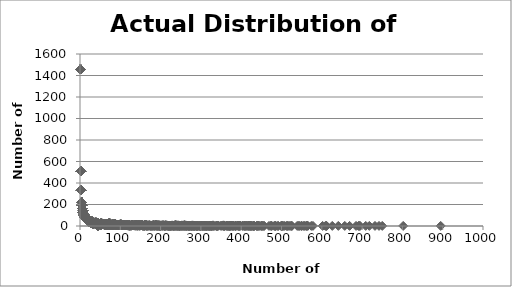
| Category | Actual Number of Athletes |
|---|---|
| 895.0 | 1 |
| 802.0 | 1 |
| 750.0 | 1 |
| 742.0 | 1 |
| 732.0 | 1 |
| 718.0 | 1 |
| 709.0 | 1 |
| 695.0 | 1 |
| 693.0 | 1 |
| 691.0 | 1 |
| 685.0 | 1 |
| 669.0 | 1 |
| 657.0 | 1 |
| 641.0 | 1 |
| 626.0 | 1 |
| 612.0 | 1 |
| 611.0 | 1 |
| 609.0 | 1 |
| 602.0 | 1 |
| 578.0 | 1 |
| 574.0 | 1 |
| 565.0 | 2 |
| 565.0 | 2 |
| 562.0 | 1 |
| 561.0 | 1 |
| 557.0 | 1 |
| 550.0 | 1 |
| 549.0 | 1 |
| 545.0 | 1 |
| 542.0 | 1 |
| 539.0 | 1 |
| 554.0 | 1 |
| 526.0 | 1 |
| 525.0 | 1 |
| 523.0 | 1 |
| 519.0 | 1 |
| 516.0 | 1 |
| 514.0 | 1 |
| 513.0 | 1 |
| 508.0 | 1 |
| 504.0 | 1 |
| 503.0 | 1 |
| 501.0 | 1 |
| 500.0 | 1 |
| 499.0 | 1 |
| 492.0 | 1 |
| 491.0 | 1 |
| 486.0 | 1 |
| 485.0 | 1 |
| 484.0 | 1 |
| 482.0 | 1 |
| 476.0 | 1 |
| 474.0 | 2 |
| 474.0 | 2 |
| 469.0 | 1 |
| 457.0 | 1 |
| 456.0 | 1 |
| 453.0 | 1 |
| 451.0 | 2 |
| 451.0 | 2 |
| 449.0 | 1 |
| 445.0 | 1 |
| 442.0 | 2 |
| 442.0 | 2 |
| 441.0 | 1 |
| 439.0 | 1 |
| 438.0 | 1 |
| 433.0 | 1 |
| 432.0 | 1 |
| 431.0 | 1 |
| 430.0 | 1 |
| 429.0 | 1 |
| 426.0 | 1 |
| 425.0 | 1 |
| 423.0 | 1 |
| 422.0 | 3 |
| 422.0 | 3 |
| 422.0 | 3 |
| 421.0 | 1 |
| 418.0 | 2 |
| 418.0 | 2 |
| 417.0 | 1 |
| 414.0 | 2 |
| 414.0 | 2 |
| 411.0 | 1 |
| 409.0 | 2 |
| 409.0 | 2 |
| 407.0 | 2 |
| 407.0 | 2 |
| 403.0 | 2 |
| 403.0 | 2 |
| 397.0 | 3 |
| 397.0 | 3 |
| 397.0 | 3 |
| 396.0 | 3 |
| 396.0 | 3 |
| 396.0 | 3 |
| 395.0 | 1 |
| 394.0 | 2 |
| 394.0 | 2 |
| 392.0 | 3 |
| 392.0 | 3 |
| 392.0 | 3 |
| 387.0 | 2 |
| 387.0 | 2 |
| 386.0 | 1 |
| 385.0 | 1 |
| 382.0 | 1 |
| 380.0 | 2 |
| 380.0 | 2 |
| 378.0 | 1 |
| 376.0 | 3 |
| 376.0 | 3 |
| 376.0 | 3 |
| 373.0 | 2 |
| 373.0 | 2 |
| 372.0 | 1 |
| 371.0 | 1 |
| 370.0 | 1 |
| 368.0 | 1 |
| 367.0 | 1 |
| 365.0 | 1 |
| 364.0 | 3 |
| 364.0 | 3 |
| 364.0 | 3 |
| 342.0 | 2 |
| 359.0 | 2 |
| 359.0 | 2 |
| 358.0 | 3 |
| 358.0 | 3 |
| 358.0 | 3 |
| 357.0 | 3 |
| 357.0 | 3 |
| 357.0 | 3 |
| 356.0 | 5 |
| 356.0 | 5 |
| 356.0 | 5 |
| 356.0 | 5 |
| 356.0 | 5 |
| 355.0 | 1 |
| 350.0 | 2 |
| 350.0 | 2 |
| 343.0 | 4 |
| 343.0 | 4 |
| 343.0 | 4 |
| 343.0 | 4 |
| 342.0 | 2 |
| 341.0 | 2 |
| 341.0 | 2 |
| 339.0 | 2 |
| 339.0 | 2 |
| 338.0 | 2 |
| 338.0 | 2 |
| 333.0 | 1 |
| 331.0 | 1 |
| 330.0 | 5 |
| 330.0 | 5 |
| 330.0 | 5 |
| 330.0 | 5 |
| 330.0 | 5 |
| 329.0 | 1 |
| 327.0 | 1 |
| 326.0 | 2 |
| 326.0 | 2 |
| 325.0 | 3 |
| 325.0 | 3 |
| 325.0 | 3 |
| 324.0 | 3 |
| 324.0 | 3 |
| 324.0 | 3 |
| 322.0 | 1 |
| 321.0 | 2 |
| 321.0 | 2 |
| 320.0 | 1 |
| 319.0 | 1 |
| 317.0 | 1 |
| 315.0 | 2 |
| 315.0 | 2 |
| 314.0 | 2 |
| 314.0 | 2 |
| 313.0 | 1 |
| 311.0 | 2 |
| 311.0 | 2 |
| 310.0 | 2 |
| 310.0 | 2 |
| 308.0 | 3 |
| 308.0 | 3 |
| 308.0 | 3 |
| 307.0 | 1 |
| 305.0 | 1 |
| 304.0 | 2 |
| 304.0 | 2 |
| 302.0 | 3 |
| 302.0 | 3 |
| 302.0 | 3 |
| 300.0 | 1 |
| 299.0 | 1 |
| 298.0 | 1 |
| 297.0 | 1 |
| 296.0 | 1 |
| 293.0 | 2 |
| 293.0 | 2 |
| 292.0 | 1 |
| 291.0 | 1 |
| 290.0 | 1 |
| 289.0 | 1 |
| 288.0 | 2 |
| 288.0 | 2 |
| 285.0 | 2 |
| 285.0 | 2 |
| 284.0 | 3 |
| 284.0 | 3 |
| 284.0 | 3 |
| 283.0 | 1 |
| 282.0 | 2 |
| 282.0 | 2 |
| 280.0 | 1 |
| 279.0 | 5 |
| 279.0 | 5 |
| 279.0 | 5 |
| 279.0 | 5 |
| 279.0 | 5 |
| 278.0 | 2 |
| 278.0 | 2 |
| 277.0 | 1 |
| 276.0 | 1 |
| 275.0 | 4 |
| 275.0 | 4 |
| 275.0 | 4 |
| 275.0 | 4 |
| 274.0 | 3 |
| 274.0 | 3 |
| 274.0 | 3 |
| 272.0 | 2 |
| 272.0 | 2 |
| 271.0 | 3 |
| 271.0 | 3 |
| 271.0 | 3 |
| 270.0 | 2 |
| 270.0 | 2 |
| 269.0 | 1 |
| 267.0 | 4 |
| 267.0 | 4 |
| 267.0 | 4 |
| 267.0 | 4 |
| 266.0 | 3 |
| 266.0 | 3 |
| 266.0 | 3 |
| 265.0 | 4 |
| 265.0 | 4 |
| 265.0 | 4 |
| 265.0 | 4 |
| 264.0 | 1 |
| 263.0 | 1 |
| 262.0 | 5 |
| 262.0 | 5 |
| 262.0 | 5 |
| 262.0 | 5 |
| 262.0 | 5 |
| 261.0 | 3 |
| 261.0 | 3 |
| 261.0 | 3 |
| 260.0 | 2 |
| 260.0 | 2 |
| 259.0 | 6 |
| 259.0 | 6 |
| 259.0 | 6 |
| 259.0 | 6 |
| 259.0 | 6 |
| 259.0 | 6 |
| 257.0 | 4 |
| 257.0 | 4 |
| 257.0 | 4 |
| 257.0 | 4 |
| 256.0 | 3 |
| 256.0 | 3 |
| 256.0 | 3 |
| 255.0 | 1 |
| 253.0 | 5 |
| 253.0 | 5 |
| 253.0 | 5 |
| 253.0 | 5 |
| 253.0 | 5 |
| 252.0 | 3 |
| 252.0 | 3 |
| 252.0 | 3 |
| 251.0 | 1 |
| 250.0 | 4 |
| 250.0 | 4 |
| 250.0 | 4 |
| 250.0 | 4 |
| 249.0 | 4 |
| 249.0 | 4 |
| 249.0 | 4 |
| 249.0 | 4 |
| 248.0 | 3 |
| 248.0 | 3 |
| 248.0 | 3 |
| 247.0 | 1 |
| 246.0 | 2 |
| 246.0 | 2 |
| 245.0 | 1 |
| 244.0 | 5 |
| 244.0 | 5 |
| 244.0 | 5 |
| 244.0 | 5 |
| 244.0 | 5 |
| 243.0 | 2 |
| 243.0 | 2 |
| 242.0 | 5 |
| 242.0 | 5 |
| 242.0 | 5 |
| 242.0 | 5 |
| 242.0 | 5 |
| 241.0 | 3 |
| 241.0 | 3 |
| 241.0 | 3 |
| 240.0 | 3 |
| 240.0 | 3 |
| 240.0 | 3 |
| 239.0 | 4 |
| 239.0 | 4 |
| 239.0 | 4 |
| 239.0 | 4 |
| 238.0 | 6 |
| 238.0 | 6 |
| 238.0 | 6 |
| 238.0 | 6 |
| 238.0 | 6 |
| 238.0 | 6 |
| 237.0 | 2 |
| 237.0 | 2 |
| 236.0 | 6 |
| 236.0 | 6 |
| 236.0 | 6 |
| 236.0 | 6 |
| 236.0 | 6 |
| 236.0 | 6 |
| 234.0 | 2 |
| 234.0 | 2 |
| 233.0 | 1 |
| 232.0 | 3 |
| 232.0 | 3 |
| 232.0 | 3 |
| 231.0 | 2 |
| 231.0 | 2 |
| 230.0 | 4 |
| 230.0 | 4 |
| 230.0 | 4 |
| 230.0 | 4 |
| 229.0 | 5 |
| 229.0 | 5 |
| 229.0 | 5 |
| 229.0 | 5 |
| 229.0 | 5 |
| 228.0 | 4 |
| 228.0 | 4 |
| 228.0 | 4 |
| 228.0 | 4 |
| 227.0 | 4 |
| 227.0 | 4 |
| 227.0 | 4 |
| 227.0 | 4 |
| 226.0 | 2 |
| 226.0 | 2 |
| 225.0 | 1 |
| 224.0 | 3 |
| 224.0 | 3 |
| 224.0 | 3 |
| 223.0 | 4 |
| 223.0 | 4 |
| 223.0 | 4 |
| 223.0 | 4 |
| 222.0 | 2 |
| 222.0 | 2 |
| 221.0 | 2 |
| 221.0 | 2 |
| 220.0 | 4 |
| 220.0 | 4 |
| 220.0 | 4 |
| 220.0 | 4 |
| 219.0 | 2 |
| 219.0 | 2 |
| 217.0 | 3 |
| 217.0 | 3 |
| 217.0 | 3 |
| 216.0 | 4 |
| 216.0 | 4 |
| 216.0 | 4 |
| 216.0 | 4 |
| 215.0 | 5 |
| 215.0 | 5 |
| 215.0 | 5 |
| 215.0 | 5 |
| 215.0 | 5 |
| 214.0 | 5 |
| 214.0 | 5 |
| 214.0 | 5 |
| 214.0 | 5 |
| 214.0 | 5 |
| 213.0 | 2 |
| 213.0 | 2 |
| 212.0 | 6 |
| 212.0 | 6 |
| 212.0 | 6 |
| 212.0 | 6 |
| 212.0 | 6 |
| 212.0 | 6 |
| 211.0 | 3 |
| 211.0 | 3 |
| 211.0 | 3 |
| 210.0 | 2 |
| 210.0 | 2 |
| 209.0 | 3 |
| 209.0 | 3 |
| 209.0 | 3 |
| 208.0 | 4 |
| 208.0 | 4 |
| 208.0 | 4 |
| 208.0 | 4 |
| 207.0 | 5 |
| 207.0 | 5 |
| 207.0 | 5 |
| 207.0 | 5 |
| 207.0 | 5 |
| 206.0 | 6 |
| 206.0 | 6 |
| 206.0 | 6 |
| 206.0 | 6 |
| 206.0 | 6 |
| 206.0 | 6 |
| 205.0 | 4 |
| 205.0 | 4 |
| 205.0 | 4 |
| 205.0 | 4 |
| 204.0 | 3 |
| 204.0 | 3 |
| 204.0 | 3 |
| 203.0 | 4 |
| 203.0 | 4 |
| 203.0 | 4 |
| 203.0 | 4 |
| 202.0 | 5 |
| 202.0 | 5 |
| 202.0 | 5 |
| 202.0 | 5 |
| 202.0 | 5 |
| 201.0 | 5 |
| 201.0 | 5 |
| 201.0 | 5 |
| 201.0 | 5 |
| 201.0 | 5 |
| 200.0 | 3 |
| 200.0 | 3 |
| 200.0 | 3 |
| 199.0 | 1 |
| 198.0 | 2 |
| 198.0 | 2 |
| 197.0 | 3 |
| 197.0 | 3 |
| 197.0 | 3 |
| 196.0 | 6 |
| 196.0 | 6 |
| 196.0 | 6 |
| 196.0 | 6 |
| 196.0 | 6 |
| 196.0 | 6 |
| 195.0 | 3 |
| 195.0 | 3 |
| 195.0 | 3 |
| 194.0 | 4 |
| 20.0 | 63 |
| 194.0 | 4 |
| 194.0 | 4 |
| 194.0 | 4 |
| 193.0 | 6 |
| 193.0 | 6 |
| 193.0 | 6 |
| 193.0 | 6 |
| 193.0 | 6 |
| 193.0 | 6 |
| 192.0 | 1 |
| 20.0 | 63 |
| 191.0 | 4 |
| 191.0 | 4 |
| 191.0 | 4 |
| 191.0 | 4 |
| 190.0 | 7 |
| 190.0 | 7 |
| 190.0 | 7 |
| 190.0 | 7 |
| 190.0 | 7 |
| 190.0 | 7 |
| 190.0 | 7 |
| 189.0 | 2 |
| 189.0 | 2 |
| 188.0 | 5 |
| 188.0 | 5 |
| 188.0 | 5 |
| 188.0 | 5 |
| 188.0 | 5 |
| 187.0 | 9 |
| 187.0 | 9 |
| 187.0 | 9 |
| 187.0 | 9 |
| 187.0 | 9 |
| 187.0 | 9 |
| 187.0 | 9 |
| 187.0 | 9 |
| 187.0 | 9 |
| 186.0 | 4 |
| 186.0 | 4 |
| 186.0 | 4 |
| 186.0 | 4 |
| 185.0 | 4 |
| 185.0 | 4 |
| 185.0 | 4 |
| 185.0 | 4 |
| 184.0 | 3 |
| 184.0 | 3 |
| 184.0 | 3 |
| 183.0 | 5 |
| 183.0 | 5 |
| 183.0 | 5 |
| 183.0 | 5 |
| 183.0 | 5 |
| 182.0 | 7 |
| 182.0 | 7 |
| 182.0 | 7 |
| 182.0 | 7 |
| 182.0 | 7 |
| 182.0 | 7 |
| 182.0 | 7 |
| 181.0 | 3 |
| 181.0 | 3 |
| 181.0 | 3 |
| 180.0 | 5 |
| 180.0 | 5 |
| 180.0 | 5 |
| 180.0 | 5 |
| 180.0 | 5 |
| 179.0 | 4 |
| 179.0 | 4 |
| 179.0 | 4 |
| 179.0 | 4 |
| 178.0 | 3 |
| 178.0 | 3 |
| 178.0 | 3 |
| 177.0 | 4 |
| 177.0 | 4 |
| 177.0 | 4 |
| 177.0 | 4 |
| 176.0 | 4 |
| 176.0 | 4 |
| 176.0 | 4 |
| 176.0 | 4 |
| 175.0 | 4 |
| 175.0 | 4 |
| 175.0 | 4 |
| 175.0 | 4 |
| 174.0 | 3 |
| 174.0 | 3 |
| 174.0 | 3 |
| 173.0 | 5 |
| 173.0 | 5 |
| 173.0 | 5 |
| 173.0 | 5 |
| 173.0 | 5 |
| 172.0 | 6 |
| 172.0 | 6 |
| 172.0 | 6 |
| 172.0 | 6 |
| 172.0 | 6 |
| 172.0 | 6 |
| 171.0 | 5 |
| 171.0 | 5 |
| 171.0 | 5 |
| 171.0 | 5 |
| 171.0 | 5 |
| 170.0 | 4 |
| 170.0 | 4 |
| 170.0 | 4 |
| 170.0 | 4 |
| 169.0 | 4 |
| 169.0 | 4 |
| 169.0 | 4 |
| 169.0 | 4 |
| 169.0 | 4 |
| 168.0 | 4 |
| 168.0 | 4 |
| 168.0 | 4 |
| 168.0 | 4 |
| 167.0 | 3 |
| 167.0 | 3 |
| 167.0 | 3 |
| 166.0 | 6 |
| 166.0 | 6 |
| 166.0 | 6 |
| 166.0 | 6 |
| 166.0 | 6 |
| 166.0 | 6 |
| 165.0 | 2 |
| 165.0 | 2 |
| 164.0 | 6 |
| 164.0 | 6 |
| 164.0 | 6 |
| 164.0 | 6 |
| 164.0 | 6 |
| 164.0 | 6 |
| 163.0 | 4 |
| 163.0 | 4 |
| 163.0 | 4 |
| 163.0 | 4 |
| 162.0 | 13 |
| 162.0 | 13 |
| 162.0 | 13 |
| 162.0 | 13 |
| 162.0 | 13 |
| 162.0 | 13 |
| 162.0 | 13 |
| 162.0 | 13 |
| 162.0 | 13 |
| 162.0 | 13 |
| 162.0 | 13 |
| 162.0 | 13 |
| 162.0 | 13 |
| 161.0 | 7 |
| 161.0 | 7 |
| 161.0 | 7 |
| 161.0 | 7 |
| 161.0 | 7 |
| 161.0 | 7 |
| 161.0 | 7 |
| 160.0 | 2 |
| 160.0 | 2 |
| 159.0 | 3 |
| 159.0 | 3 |
| 159.0 | 3 |
| 158.0 | 5 |
| 158.0 | 5 |
| 158.0 | 5 |
| 158.0 | 5 |
| 158.0 | 5 |
| 157.0 | 3 |
| 157.0 | 3 |
| 157.0 | 3 |
| 156.0 | 3 |
| 156.0 | 3 |
| 156.0 | 3 |
| 155.0 | 8 |
| 155.0 | 8 |
| 155.0 | 8 |
| 155.0 | 8 |
| 155.0 | 8 |
| 155.0 | 8 |
| 155.0 | 8 |
| 155.0 | 8 |
| 154.0 | 8 |
| 154.0 | 8 |
| 154.0 | 8 |
| 154.0 | 8 |
| 154.0 | 8 |
| 154.0 | 8 |
| 154.0 | 8 |
| 154.0 | 8 |
| 153.0 | 8 |
| 153.0 | 8 |
| 153.0 | 8 |
| 153.0 | 8 |
| 153.0 | 8 |
| 153.0 | 8 |
| 153.0 | 8 |
| 153.0 | 8 |
| 152.0 | 6 |
| 152.0 | 6 |
| 152.0 | 6 |
| 152.0 | 6 |
| 152.0 | 6 |
| 152.0 | 6 |
| 151.0 | 7 |
| 151.0 | 7 |
| 151.0 | 7 |
| 151.0 | 7 |
| 151.0 | 7 |
| 151.0 | 7 |
| 151.0 | 7 |
| 150.0 | 7 |
| 150.0 | 7 |
| 150.0 | 7 |
| 150.0 | 7 |
| 150.0 | 7 |
| 150.0 | 7 |
| 150.0 | 7 |
| 149.0 | 4 |
| 149.0 | 4 |
| 149.0 | 4 |
| 149.0 | 4 |
| 148.0 | 7 |
| 148.0 | 7 |
| 148.0 | 7 |
| 148.0 | 7 |
| 148.0 | 7 |
| 148.0 | 7 |
| 148.0 | 7 |
| 147.0 | 1 |
| 146.0 | 8 |
| 146.0 | 8 |
| 146.0 | 8 |
| 146.0 | 8 |
| 146.0 | 8 |
| 146.0 | 8 |
| 146.0 | 8 |
| 146.0 | 8 |
| 145.0 | 11 |
| 145.0 | 11 |
| 145.0 | 11 |
| 145.0 | 11 |
| 145.0 | 11 |
| 145.0 | 11 |
| 145.0 | 11 |
| 145.0 | 11 |
| 145.0 | 11 |
| 145.0 | 11 |
| 145.0 | 11 |
| 144.0 | 7 |
| 144.0 | 7 |
| 144.0 | 7 |
| 144.0 | 7 |
| 144.0 | 7 |
| 144.0 | 7 |
| 144.0 | 7 |
| 143.0 | 2 |
| 143.0 | 2 |
| 142.0 | 6 |
| 142.0 | 6 |
| 142.0 | 6 |
| 142.0 | 6 |
| 142.0 | 6 |
| 142.0 | 6 |
| 141.0 | 6 |
| 141.0 | 6 |
| 141.0 | 6 |
| 141.0 | 6 |
| 141.0 | 6 |
| 141.0 | 6 |
| 140.0 | 13 |
| 140.0 | 13 |
| 140.0 | 13 |
| 140.0 | 13 |
| 140.0 | 13 |
| 140.0 | 13 |
| 140.0 | 13 |
| 140.0 | 13 |
| 140.0 | 13 |
| 140.0 | 13 |
| 140.0 | 13 |
| 140.0 | 13 |
| 140.0 | 13 |
| 139.0 | 1 |
| 138.0 | 7 |
| 138.0 | 7 |
| 138.0 | 7 |
| 138.0 | 7 |
| 138.0 | 7 |
| 138.0 | 7 |
| 138.0 | 7 |
| 137.0 | 8 |
| 137.0 | 8 |
| 137.0 | 8 |
| 137.0 | 8 |
| 137.0 | 8 |
| 137.0 | 8 |
| 137.0 | 8 |
| 137.0 | 8 |
| 136.0 | 4 |
| 136.0 | 4 |
| 136.0 | 4 |
| 136.0 | 4 |
| 135.0 | 6 |
| 135.0 | 6 |
| 135.0 | 6 |
| 135.0 | 6 |
| 135.0 | 6 |
| 135.0 | 6 |
| 134.0 | 7 |
| 134.0 | 7 |
| 134.0 | 7 |
| 134.0 | 7 |
| 134.0 | 7 |
| 134.0 | 7 |
| 134.0 | 7 |
| 133.0 | 5 |
| 133.0 | 5 |
| 133.0 | 5 |
| 133.0 | 5 |
| 133.0 | 5 |
| 132.0 | 5 |
| 132.0 | 5 |
| 132.0 | 5 |
| 132.0 | 5 |
| 132.0 | 5 |
| 131.0 | 5 |
| 131.0 | 5 |
| 131.0 | 5 |
| 131.0 | 5 |
| 131.0 | 5 |
| 130.0 | 8 |
| 20.0 | 63 |
| 130.0 | 8 |
| 130.0 | 8 |
| 130.0 | 8 |
| 130.0 | 8 |
| 130.0 | 8 |
| 130.0 | 8 |
| 130.0 | 8 |
| 129.0 | 13 |
| 129.0 | 13 |
| 129.0 | 13 |
| 129.0 | 13 |
| 129.0 | 13 |
| 129.0 | 13 |
| 129.0 | 13 |
| 129.0 | 13 |
| 129.0 | 13 |
| 129.0 | 13 |
| 129.0 | 13 |
| 129.0 | 13 |
| 129.0 | 13 |
| 128.0 | 11 |
| 128.0 | 11 |
| 128.0 | 11 |
| 128.0 | 11 |
| 128.0 | 11 |
| 128.0 | 11 |
| 128.0 | 11 |
| 128.0 | 11 |
| 128.0 | 11 |
| 128.0 | 11 |
| 128.0 | 11 |
| 127.0 | 3 |
| 127.0 | 3 |
| 127.0 | 3 |
| 126.0 | 5 |
| 126.0 | 5 |
| 126.0 | 5 |
| 126.0 | 5 |
| 126.0 | 5 |
| 125.0 | 5 |
| 125.0 | 5 |
| 125.0 | 5 |
| 125.0 | 5 |
| 125.0 | 5 |
| 124.0 | 3 |
| 124.0 | 3 |
| 124.0 | 3 |
| 123.0 | 3 |
| 123.0 | 3 |
| 123.0 | 3 |
| 122.0 | 10 |
| 122.0 | 10 |
| 122.0 | 10 |
| 122.0 | 10 |
| 122.0 | 10 |
| 122.0 | 10 |
| 122.0 | 10 |
| 122.0 | 10 |
| 122.0 | 10 |
| 122.0 | 10 |
| 121.0 | 4 |
| 121.0 | 4 |
| 121.0 | 4 |
| 121.0 | 4 |
| 120.0 | 4 |
| 120.0 | 4 |
| 120.0 | 4 |
| 120.0 | 4 |
| 119.0 | 7 |
| 119.0 | 7 |
| 119.0 | 7 |
| 119.0 | 7 |
| 119.0 | 7 |
| 119.0 | 7 |
| 119.0 | 7 |
| 118.0 | 9 |
| 118.0 | 9 |
| 118.0 | 9 |
| 118.0 | 9 |
| 118.0 | 9 |
| 118.0 | 9 |
| 118.0 | 9 |
| 118.0 | 9 |
| 118.0 | 9 |
| 117.0 | 5 |
| 117.0 | 5 |
| 117.0 | 5 |
| 117.0 | 5 |
| 117.0 | 5 |
| 116.0 | 9 |
| 116.0 | 9 |
| 116.0 | 9 |
| 116.0 | 9 |
| 116.0 | 9 |
| 116.0 | 9 |
| 116.0 | 9 |
| 116.0 | 9 |
| 116.0 | 9 |
| 115.0 | 10 |
| 115.0 | 10 |
| 115.0 | 10 |
| 115.0 | 10 |
| 115.0 | 10 |
| 115.0 | 10 |
| 115.0 | 10 |
| 115.0 | 10 |
| 115.0 | 10 |
| 115.0 | 10 |
| 114.0 | 7 |
| 114.0 | 7 |
| 114.0 | 7 |
| 114.0 | 7 |
| 114.0 | 7 |
| 114.0 | 7 |
| 114.0 | 7 |
| 113.0 | 5 |
| 113.0 | 5 |
| 113.0 | 5 |
| 113.0 | 5 |
| 113.0 | 5 |
| 112.0 | 7 |
| 112.0 | 7 |
| 112.0 | 7 |
| 112.0 | 7 |
| 112.0 | 7 |
| 112.0 | 7 |
| 112.0 | 7 |
| 111.0 | 10 |
| 111.0 | 10 |
| 111.0 | 10 |
| 111.0 | 10 |
| 111.0 | 10 |
| 111.0 | 10 |
| 111.0 | 10 |
| 111.0 | 10 |
| 111.0 | 10 |
| 111.0 | 10 |
| 111.0 | 10 |
| 111.0 | 10 |
| 110.0 | 7 |
| 110.0 | 7 |
| 110.0 | 7 |
| 110.0 | 7 |
| 110.0 | 7 |
| 110.0 | 7 |
| 110.0 | 7 |
| 109.0 | 7 |
| 109.0 | 7 |
| 109.0 | 7 |
| 109.0 | 7 |
| 109.0 | 7 |
| 109.0 | 7 |
| 109.0 | 7 |
| 108.0 | 7 |
| 108.0 | 7 |
| 108.0 | 7 |
| 108.0 | 7 |
| 108.0 | 7 |
| 108.0 | 7 |
| 108.0 | 7 |
| 107.0 | 13 |
| 107.0 | 13 |
| 107.0 | 13 |
| 107.0 | 13 |
| 107.0 | 13 |
| 107.0 | 13 |
| 107.0 | 13 |
| 107.0 | 13 |
| 107.0 | 13 |
| 107.0 | 13 |
| 107.0 | 13 |
| 107.0 | 13 |
| 107.0 | 13 |
| 106.0 | 11 |
| 106.0 | 11 |
| 106.0 | 11 |
| 106.0 | 11 |
| 106.0 | 11 |
| 106.0 | 11 |
| 106.0 | 11 |
| 106.0 | 11 |
| 106.0 | 11 |
| 106.0 | 11 |
| 106.0 | 11 |
| 105.0 | 12 |
| 105.0 | 12 |
| 105.0 | 12 |
| 105.0 | 12 |
| 105.0 | 12 |
| 105.0 | 12 |
| 105.0 | 12 |
| 105.0 | 12 |
| 105.0 | 12 |
| 105.0 | 12 |
| 105.0 | 12 |
| 105.0 | 12 |
| 104.0 | 5 |
| 104.0 | 5 |
| 104.0 | 5 |
| 104.0 | 5 |
| 104.0 | 5 |
| 103.0 | 5 |
| 103.0 | 5 |
| 103.0 | 5 |
| 103.0 | 5 |
| 103.0 | 5 |
| 102.0 | 14 |
| 102.0 | 14 |
| 102.0 | 14 |
| 102.0 | 14 |
| 102.0 | 14 |
| 102.0 | 14 |
| 102.0 | 14 |
| 102.0 | 14 |
| 102.0 | 14 |
| 102.0 | 14 |
| 102.0 | 14 |
| 102.0 | 14 |
| 102.0 | 14 |
| 102.0 | 14 |
| 101.0 | 15 |
| 101.0 | 15 |
| 101.0 | 15 |
| 101.0 | 15 |
| 101.0 | 15 |
| 101.0 | 15 |
| 101.0 | 15 |
| 101.0 | 15 |
| 101.0 | 15 |
| 101.0 | 15 |
| 101.0 | 15 |
| 101.0 | 15 |
| 101.0 | 15 |
| 101.0 | 15 |
| 101.0 | 15 |
| 100.0 | 13 |
| 100.0 | 13 |
| 100.0 | 13 |
| 100.0 | 13 |
| 100.0 | 13 |
| 100.0 | 13 |
| 100.0 | 13 |
| 100.0 | 13 |
| 100.0 | 13 |
| 100.0 | 13 |
| 100.0 | 13 |
| 100.0 | 13 |
| 100.0 | 13 |
| 99.0 | 10 |
| 99.0 | 10 |
| 99.0 | 10 |
| 99.0 | 10 |
| 99.0 | 10 |
| 99.0 | 10 |
| 99.0 | 10 |
| 99.0 | 10 |
| 99.0 | 10 |
| 99.0 | 10 |
| 98.0 | 7 |
| 98.0 | 7 |
| 98.0 | 7 |
| 98.0 | 7 |
| 98.0 | 7 |
| 98.0 | 7 |
| 98.0 | 7 |
| 97.0 | 12 |
| 97.0 | 12 |
| 97.0 | 12 |
| 97.0 | 12 |
| 97.0 | 12 |
| 97.0 | 12 |
| 97.0 | 12 |
| 97.0 | 12 |
| 97.0 | 12 |
| 97.0 | 12 |
| 97.0 | 12 |
| 97.0 | 12 |
| 96.0 | 5 |
| 96.0 | 5 |
| 96.0 | 5 |
| 96.0 | 5 |
| 96.0 | 5 |
| 95.0 | 13 |
| 95.0 | 13 |
| 95.0 | 13 |
| 95.0 | 13 |
| 95.0 | 13 |
| 95.0 | 13 |
| 95.0 | 13 |
| 95.0 | 13 |
| 95.0 | 13 |
| 95.0 | 13 |
| 95.0 | 13 |
| 95.0 | 13 |
| 95.0 | 13 |
| 94.0 | 10 |
| 94.0 | 10 |
| 94.0 | 10 |
| 94.0 | 10 |
| 94.0 | 10 |
| 94.0 | 10 |
| 94.0 | 10 |
| 94.0 | 10 |
| 94.0 | 10 |
| 94.0 | 10 |
| 93.0 | 11 |
| 93.0 | 11 |
| 93.0 | 11 |
| 93.0 | 11 |
| 93.0 | 11 |
| 93.0 | 11 |
| 93.0 | 11 |
| 93.0 | 11 |
| 93.0 | 11 |
| 93.0 | 11 |
| 93.0 | 11 |
| 92.0 | 7 |
| 92.0 | 7 |
| 92.0 | 7 |
| 92.0 | 7 |
| 92.0 | 7 |
| 92.0 | 7 |
| 92.0 | 7 |
| 91.0 | 10 |
| 91.0 | 10 |
| 91.0 | 10 |
| 91.0 | 10 |
| 91.0 | 10 |
| 91.0 | 10 |
| 91.0 | 10 |
| 91.0 | 10 |
| 91.0 | 10 |
| 91.0 | 10 |
| 90.0 | 9 |
| 90.0 | 9 |
| 90.0 | 9 |
| 90.0 | 9 |
| 90.0 | 9 |
| 90.0 | 9 |
| 90.0 | 9 |
| 90.0 | 9 |
| 90.0 | 9 |
| 89.0 | 8 |
| 89.0 | 8 |
| 89.0 | 8 |
| 89.0 | 8 |
| 89.0 | 8 |
| 89.0 | 8 |
| 89.0 | 8 |
| 89.0 | 8 |
| 88.0 | 18 |
| 88.0 | 18 |
| 88.0 | 18 |
| 88.0 | 18 |
| 88.0 | 18 |
| 88.0 | 18 |
| 88.0 | 18 |
| 88.0 | 18 |
| 88.0 | 18 |
| 88.0 | 18 |
| 88.0 | 18 |
| 88.0 | 18 |
| 88.0 | 18 |
| 88.0 | 18 |
| 88.0 | 18 |
| 88.0 | 18 |
| 88.0 | 18 |
| 88.0 | 18 |
| 87.0 | 9 |
| 87.0 | 9 |
| 87.0 | 9 |
| 87.0 | 9 |
| 87.0 | 9 |
| 87.0 | 9 |
| 87.0 | 9 |
| 87.0 | 9 |
| 87.0 | 9 |
| 86.0 | 12 |
| 86.0 | 12 |
| 86.0 | 12 |
| 86.0 | 12 |
| 86.0 | 12 |
| 86.0 | 12 |
| 86.0 | 12 |
| 86.0 | 12 |
| 86.0 | 12 |
| 86.0 | 12 |
| 86.0 | 12 |
| 86.0 | 12 |
| 85.0 | 19 |
| 85.0 | 19 |
| 85.0 | 19 |
| 85.0 | 19 |
| 85.0 | 19 |
| 85.0 | 19 |
| 85.0 | 19 |
| 85.0 | 19 |
| 85.0 | 19 |
| 85.0 | 19 |
| 85.0 | 19 |
| 85.0 | 19 |
| 85.0 | 19 |
| 85.0 | 19 |
| 85.0 | 19 |
| 85.0 | 19 |
| 85.0 | 19 |
| 85.0 | 19 |
| 85.0 | 19 |
| 84.0 | 12 |
| 84.0 | 12 |
| 84.0 | 12 |
| 84.0 | 12 |
| 84.0 | 12 |
| 84.0 | 12 |
| 84.0 | 12 |
| 84.0 | 12 |
| 84.0 | 12 |
| 84.0 | 12 |
| 84.0 | 12 |
| 84.0 | 12 |
| 83.0 | 14 |
| 83.0 | 14 |
| 83.0 | 14 |
| 83.0 | 14 |
| 83.0 | 14 |
| 83.0 | 14 |
| 83.0 | 14 |
| 83.0 | 14 |
| 83.0 | 14 |
| 83.0 | 14 |
| 83.0 | 14 |
| 83.0 | 14 |
| 83.0 | 14 |
| 83.0 | 14 |
| 82.0 | 8 |
| 82.0 | 8 |
| 82.0 | 8 |
| 82.0 | 8 |
| 82.0 | 8 |
| 82.0 | 8 |
| 82.0 | 8 |
| 82.0 | 8 |
| 81.0 | 18 |
| 81.0 | 18 |
| 81.0 | 18 |
| 81.0 | 18 |
| 81.0 | 18 |
| 81.0 | 18 |
| 81.0 | 18 |
| 81.0 | 18 |
| 81.0 | 18 |
| 81.0 | 18 |
| 81.0 | 18 |
| 81.0 | 18 |
| 81.0 | 18 |
| 81.0 | 18 |
| 81.0 | 18 |
| 81.0 | 18 |
| 81.0 | 18 |
| 81.0 | 18 |
| 80.0 | 8 |
| 80.0 | 8 |
| 80.0 | 8 |
| 80.0 | 8 |
| 80.0 | 8 |
| 80.0 | 8 |
| 80.0 | 8 |
| 80.0 | 8 |
| 79.0 | 9 |
| 79.0 | 9 |
| 79.0 | 9 |
| 79.0 | 9 |
| 79.0 | 9 |
| 79.0 | 9 |
| 79.0 | 9 |
| 79.0 | 9 |
| 79.0 | 9 |
| 78.0 | 12 |
| 78.0 | 12 |
| 78.0 | 12 |
| 78.0 | 12 |
| 78.0 | 12 |
| 78.0 | 12 |
| 78.0 | 12 |
| 78.0 | 12 |
| 78.0 | 12 |
| 78.0 | 12 |
| 78.0 | 12 |
| 78.0 | 12 |
| 77.0 | 10 |
| 77.0 | 10 |
| 77.0 | 10 |
| 77.0 | 10 |
| 77.0 | 10 |
| 77.0 | 10 |
| 77.0 | 10 |
| 77.0 | 10 |
| 77.0 | 10 |
| 77.0 | 10 |
| 76.0 | 17 |
| 76.0 | 17 |
| 76.0 | 17 |
| 76.0 | 17 |
| 76.0 | 17 |
| 76.0 | 17 |
| 76.0 | 17 |
| 76.0 | 17 |
| 76.0 | 17 |
| 76.0 | 17 |
| 76.0 | 17 |
| 76.0 | 17 |
| 76.0 | 17 |
| 76.0 | 17 |
| 76.0 | 17 |
| 76.0 | 17 |
| 76.0 | 17 |
| 75.0 | 9 |
| 75.0 | 9 |
| 75.0 | 9 |
| 75.0 | 9 |
| 75.0 | 9 |
| 75.0 | 9 |
| 75.0 | 9 |
| 75.0 | 9 |
| 75.0 | 9 |
| 74.0 | 10 |
| 74.0 | 10 |
| 74.0 | 10 |
| 74.0 | 10 |
| 74.0 | 10 |
| 74.0 | 10 |
| 74.0 | 10 |
| 74.0 | 10 |
| 74.0 | 10 |
| 74.0 | 10 |
| 73.0 | 26 |
| 73.0 | 26 |
| 73.0 | 26 |
| 73.0 | 26 |
| 73.0 | 26 |
| 73.0 | 26 |
| 73.0 | 26 |
| 73.0 | 26 |
| 73.0 | 26 |
| 73.0 | 26 |
| 73.0 | 26 |
| 73.0 | 26 |
| 73.0 | 26 |
| 73.0 | 26 |
| 73.0 | 26 |
| 73.0 | 26 |
| 73.0 | 26 |
| 73.0 | 26 |
| 73.0 | 26 |
| 73.0 | 26 |
| 73.0 | 26 |
| 73.0 | 26 |
| 73.0 | 26 |
| 73.0 | 26 |
| 73.0 | 26 |
| 73.0 | 26 |
| 72.0 | 13 |
| 72.0 | 13 |
| 72.0 | 13 |
| 72.0 | 13 |
| 72.0 | 13 |
| 72.0 | 13 |
| 72.0 | 13 |
| 72.0 | 13 |
| 72.0 | 13 |
| 72.0 | 13 |
| 72.0 | 13 |
| 72.0 | 13 |
| 72.0 | 13 |
| 71.0 | 12 |
| 71.0 | 12 |
| 71.0 | 12 |
| 71.0 | 12 |
| 71.0 | 12 |
| 71.0 | 12 |
| 71.0 | 12 |
| 71.0 | 12 |
| 71.0 | 12 |
| 71.0 | 12 |
| 71.0 | 12 |
| 71.0 | 12 |
| 70.0 | 10 |
| 70.0 | 10 |
| 70.0 | 10 |
| 70.0 | 10 |
| 70.0 | 10 |
| 70.0 | 10 |
| 70.0 | 10 |
| 70.0 | 10 |
| 70.0 | 10 |
| 70.0 | 10 |
| 69.0 | 21 |
| 69.0 | 21 |
| 69.0 | 21 |
| 69.0 | 21 |
| 69.0 | 21 |
| 69.0 | 21 |
| 69.0 | 21 |
| 69.0 | 21 |
| 69.0 | 21 |
| 69.0 | 21 |
| 69.0 | 21 |
| 69.0 | 21 |
| 69.0 | 21 |
| 69.0 | 21 |
| 69.0 | 21 |
| 69.0 | 21 |
| 69.0 | 21 |
| 69.0 | 21 |
| 69.0 | 21 |
| 69.0 | 21 |
| 69.0 | 21 |
| 68.0 | 16 |
| 68.0 | 16 |
| 68.0 | 16 |
| 68.0 | 16 |
| 68.0 | 16 |
| 68.0 | 16 |
| 68.0 | 16 |
| 68.0 | 16 |
| 68.0 | 16 |
| 68.0 | 16 |
| 68.0 | 16 |
| 68.0 | 16 |
| 68.0 | 16 |
| 68.0 | 16 |
| 68.0 | 16 |
| 68.0 | 16 |
| 67.0 | 8 |
| 67.0 | 8 |
| 67.0 | 8 |
| 67.0 | 8 |
| 67.0 | 8 |
| 67.0 | 8 |
| 67.0 | 8 |
| 67.0 | 8 |
| 66.0 | 11 |
| 66.0 | 11 |
| 66.0 | 11 |
| 66.0 | 11 |
| 66.0 | 11 |
| 66.0 | 11 |
| 66.0 | 11 |
| 66.0 | 11 |
| 66.0 | 11 |
| 66.0 | 11 |
| 66.0 | 11 |
| 65.0 | 21 |
| 65.0 | 21 |
| 65.0 | 21 |
| 65.0 | 21 |
| 65.0 | 21 |
| 65.0 | 21 |
| 65.0 | 21 |
| 65.0 | 21 |
| 65.0 | 21 |
| 65.0 | 21 |
| 65.0 | 21 |
| 65.0 | 21 |
| 65.0 | 21 |
| 65.0 | 21 |
| 65.0 | 21 |
| 65.0 | 21 |
| 65.0 | 21 |
| 65.0 | 21 |
| 65.0 | 21 |
| 65.0 | 21 |
| 65.0 | 21 |
| 64.0 | 14 |
| 64.0 | 14 |
| 64.0 | 14 |
| 64.0 | 14 |
| 64.0 | 14 |
| 64.0 | 14 |
| 64.0 | 14 |
| 64.0 | 14 |
| 64.0 | 14 |
| 64.0 | 14 |
| 64.0 | 14 |
| 64.0 | 14 |
| 64.0 | 14 |
| 64.0 | 14 |
| 63.0 | 11 |
| 63.0 | 11 |
| 63.0 | 11 |
| 63.0 | 11 |
| 63.0 | 11 |
| 63.0 | 11 |
| 63.0 | 11 |
| 63.0 | 11 |
| 63.0 | 11 |
| 63.0 | 11 |
| 63.0 | 11 |
| 62.0 | 14 |
| 62.0 | 14 |
| 62.0 | 14 |
| 62.0 | 14 |
| 62.0 | 14 |
| 62.0 | 14 |
| 62.0 | 14 |
| 62.0 | 14 |
| 62.0 | 14 |
| 62.0 | 14 |
| 62.0 | 14 |
| 62.0 | 14 |
| 62.0 | 14 |
| 62.0 | 14 |
| 61.0 | 11 |
| 61.0 | 11 |
| 61.0 | 11 |
| 61.0 | 11 |
| 61.0 | 11 |
| 61.0 | 11 |
| 61.0 | 11 |
| 61.0 | 11 |
| 61.0 | 11 |
| 61.0 | 11 |
| 61.0 | 11 |
| 60.0 | 17 |
| 60.0 | 17 |
| 60.0 | 17 |
| 60.0 | 17 |
| 60.0 | 17 |
| 60.0 | 17 |
| 60.0 | 17 |
| 60.0 | 17 |
| 60.0 | 17 |
| 60.0 | 17 |
| 60.0 | 17 |
| 60.0 | 17 |
| 60.0 | 17 |
| 60.0 | 17 |
| 60.0 | 17 |
| 60.0 | 17 |
| 60.0 | 17 |
| 59.0 | 18 |
| 59.0 | 18 |
| 59.0 | 18 |
| 59.0 | 18 |
| 59.0 | 18 |
| 59.0 | 18 |
| 59.0 | 18 |
| 59.0 | 18 |
| 59.0 | 18 |
| 59.0 | 18 |
| 59.0 | 18 |
| 59.0 | 18 |
| 59.0 | 18 |
| 59.0 | 18 |
| 59.0 | 18 |
| 59.0 | 18 |
| 59.0 | 18 |
| 59.0 | 18 |
| 58.0 | 21 |
| 58.0 | 21 |
| 58.0 | 21 |
| 58.0 | 21 |
| 58.0 | 21 |
| 58.0 | 21 |
| 58.0 | 21 |
| 58.0 | 21 |
| 58.0 | 21 |
| 58.0 | 21 |
| 58.0 | 21 |
| 58.0 | 21 |
| 58.0 | 21 |
| 58.0 | 21 |
| 58.0 | 21 |
| 58.0 | 21 |
| 58.0 | 21 |
| 58.0 | 21 |
| 58.0 | 21 |
| 58.0 | 21 |
| 58.0 | 21 |
| 57.0 | 22 |
| 57.0 | 22 |
| 57.0 | 22 |
| 57.0 | 22 |
| 57.0 | 22 |
| 57.0 | 22 |
| 57.0 | 22 |
| 57.0 | 22 |
| 57.0 | 22 |
| 57.0 | 22 |
| 57.0 | 22 |
| 57.0 | 22 |
| 57.0 | 22 |
| 57.0 | 22 |
| 57.0 | 22 |
| 57.0 | 22 |
| 57.0 | 22 |
| 57.0 | 22 |
| 57.0 | 22 |
| 57.0 | 22 |
| 57.0 | 22 |
| 57.0 | 22 |
| 56.0 | 22 |
| 56.0 | 22 |
| 56.0 | 22 |
| 56.0 | 22 |
| 56.0 | 22 |
| 56.0 | 22 |
| 56.0 | 22 |
| 56.0 | 22 |
| 56.0 | 22 |
| 56.0 | 22 |
| 56.0 | 22 |
| 56.0 | 22 |
| 56.0 | 22 |
| 56.0 | 22 |
| 56.0 | 22 |
| 56.0 | 22 |
| 56.0 | 22 |
| 56.0 | 22 |
| 56.0 | 22 |
| 56.0 | 22 |
| 56.0 | 22 |
| 56.0 | 22 |
| 55.0 | 17 |
| 55.0 | 17 |
| 55.0 | 17 |
| 55.0 | 17 |
| 55.0 | 17 |
| 55.0 | 17 |
| 55.0 | 17 |
| 55.0 | 17 |
| 55.0 | 17 |
| 55.0 | 17 |
| 55.0 | 17 |
| 55.0 | 17 |
| 55.0 | 17 |
| 55.0 | 17 |
| 55.0 | 17 |
| 55.0 | 17 |
| 55.0 | 17 |
| 54.0 | 20 |
| 54.0 | 20 |
| 54.0 | 20 |
| 54.0 | 20 |
| 54.0 | 20 |
| 54.0 | 20 |
| 54.0 | 20 |
| 54.0 | 20 |
| 54.0 | 20 |
| 54.0 | 20 |
| 54.0 | 20 |
| 54.0 | 20 |
| 54.0 | 20 |
| 54.0 | 20 |
| 54.0 | 20 |
| 53.0 | 26 |
| 53.0 | 26 |
| 53.0 | 26 |
| 53.0 | 26 |
| 53.0 | 26 |
| 53.0 | 26 |
| 53.0 | 26 |
| 53.0 | 26 |
| 53.0 | 26 |
| 53.0 | 26 |
| 53.0 | 26 |
| 53.0 | 26 |
| 53.0 | 26 |
| 53.0 | 26 |
| 53.0 | 26 |
| 53.0 | 26 |
| 53.0 | 26 |
| 53.0 | 26 |
| 53.0 | 26 |
| 53.0 | 26 |
| 53.0 | 26 |
| 53.0 | 26 |
| 53.0 | 26 |
| 53.0 | 26 |
| 53.0 | 26 |
| 53.0 | 26 |
| 52.0 | 11 |
| 52.0 | 11 |
| 52.0 | 11 |
| 52.0 | 11 |
| 52.0 | 11 |
| 52.0 | 11 |
| 52.0 | 11 |
| 52.0 | 11 |
| 52.0 | 11 |
| 52.0 | 11 |
| 52.0 | 11 |
| 51.0 | 14 |
| 51.0 | 14 |
| 51.0 | 14 |
| 51.0 | 14 |
| 51.0 | 14 |
| 51.0 | 14 |
| 51.0 | 14 |
| 51.0 | 14 |
| 51.0 | 14 |
| 51.0 | 14 |
| 51.0 | 14 |
| 51.0 | 14 |
| 51.0 | 14 |
| 51.0 | 14 |
| 50.0 | 21 |
| 50.0 | 21 |
| 50.0 | 21 |
| 50.0 | 21 |
| 50.0 | 21 |
| 50.0 | 21 |
| 50.0 | 21 |
| 50.0 | 21 |
| 50.0 | 21 |
| 50.0 | 21 |
| 50.0 | 21 |
| 50.0 | 21 |
| 50.0 | 21 |
| 50.0 | 21 |
| 50.0 | 21 |
| 50.0 | 21 |
| 50.0 | 21 |
| 50.0 | 21 |
| 50.0 | 21 |
| 50.0 | 21 |
| 50.0 | 21 |
| 49.0 | 20 |
| 49.0 | 20 |
| 49.0 | 20 |
| 49.0 | 20 |
| 49.0 | 20 |
| 49.0 | 20 |
| 49.0 | 20 |
| 49.0 | 20 |
| 49.0 | 20 |
| 49.0 | 20 |
| 49.0 | 20 |
| 49.0 | 20 |
| 49.0 | 20 |
| 49.0 | 20 |
| 49.0 | 20 |
| 49.0 | 20 |
| 49.0 | 20 |
| 49.0 | 20 |
| 49.0 | 20 |
| 49.0 | 20 |
| 48.0 | 16 |
| 48.0 | 16 |
| 48.0 | 16 |
| 48.0 | 16 |
| 48.0 | 16 |
| 48.0 | 16 |
| 48.0 | 16 |
| 48.0 | 16 |
| 48.0 | 16 |
| 48.0 | 16 |
| 48.0 | 16 |
| 48.0 | 16 |
| 48.0 | 16 |
| 48.0 | 16 |
| 48.0 | 16 |
| 48.0 | 16 |
| 47.0 | 16 |
| 47.0 | 16 |
| 47.0 | 16 |
| 47.0 | 16 |
| 47.0 | 16 |
| 47.0 | 16 |
| 47.0 | 16 |
| 47.0 | 16 |
| 47.0 | 16 |
| 47.0 | 16 |
| 47.0 | 16 |
| 47.0 | 16 |
| 47.0 | 16 |
| 47.0 | 16 |
| 47.0 | 16 |
| 47.0 | 16 |
| 46.0 | 18 |
| 46.0 | 18 |
| 46.0 | 18 |
| 46.0 | 18 |
| 46.0 | 18 |
| 46.0 | 18 |
| 46.0 | 18 |
| 46.0 | 18 |
| 46.0 | 18 |
| 46.0 | 18 |
| 46.0 | 18 |
| 46.0 | 18 |
| 46.0 | 18 |
| 46.0 | 18 |
| 46.0 | 18 |
| 46.0 | 18 |
| 46.0 | 18 |
| 46.0 | 18 |
| 45.0 | 25 |
| 45.0 | 25 |
| 45.0 | 25 |
| 45.0 | 25 |
| 45.0 | 25 |
| 45.0 | 25 |
| 45.0 | 25 |
| 45.0 | 25 |
| 45.0 | 25 |
| 45.0 | 25 |
| 45.0 | 25 |
| 45.0 | 25 |
| 45.0 | 25 |
| 45.0 | 25 |
| 45.0 | 25 |
| 45.0 | 25 |
| 45.0 | 25 |
| 45.0 | 25 |
| 45.0 | 25 |
| 45.0 | 25 |
| 45.0 | 25 |
| 45.0 | 25 |
| 45.0 | 25 |
| 45.0 | 25 |
| 45.0 | 25 |
| 44.0 | 1 |
| 44.0 | 1 |
| 44.0 | 1 |
| 44.0 | 1 |
| 44.0 | 1 |
| 44.0 | 1 |
| 44.0 | 1 |
| 44.0 | 1 |
| 44.0 | 1 |
| 44.0 | 1 |
| 44.0 | 1 |
| 44.0 | 1 |
| 44.0 | 1 |
| 44.0 | 1 |
| 44.0 | 1 |
| 44.0 | 1 |
| 44.0 | 1 |
| 44.0 | 1 |
| 44.0 | 1 |
| 44.0 | 1 |
| 43.0 | 29 |
| 43.0 | 29 |
| 43.0 | 29 |
| 43.0 | 29 |
| 43.0 | 29 |
| 43.0 | 29 |
| 43.0 | 29 |
| 43.0 | 29 |
| 43.0 | 29 |
| 43.0 | 29 |
| 43.0 | 29 |
| 43.0 | 29 |
| 43.0 | 29 |
| 43.0 | 29 |
| 43.0 | 29 |
| 43.0 | 29 |
| 43.0 | 29 |
| 43.0 | 29 |
| 43.0 | 29 |
| 43.0 | 29 |
| 43.0 | 29 |
| 43.0 | 29 |
| 43.0 | 29 |
| 43.0 | 29 |
| 43.0 | 29 |
| 43.0 | 29 |
| 43.0 | 29 |
| 43.0 | 29 |
| 43.0 | 29 |
| 42.0 | 25 |
| 42.0 | 25 |
| 42.0 | 25 |
| 42.0 | 25 |
| 42.0 | 25 |
| 42.0 | 25 |
| 42.0 | 25 |
| 42.0 | 25 |
| 42.0 | 25 |
| 42.0 | 25 |
| 42.0 | 25 |
| 42.0 | 25 |
| 42.0 | 25 |
| 42.0 | 25 |
| 42.0 | 25 |
| 42.0 | 25 |
| 42.0 | 25 |
| 42.0 | 25 |
| 42.0 | 25 |
| 42.0 | 25 |
| 42.0 | 25 |
| 42.0 | 25 |
| 42.0 | 25 |
| 42.0 | 25 |
| 42.0 | 25 |
| 41.0 | 22 |
| 41.0 | 22 |
| 41.0 | 22 |
| 41.0 | 22 |
| 41.0 | 22 |
| 41.0 | 22 |
| 41.0 | 22 |
| 41.0 | 22 |
| 41.0 | 22 |
| 41.0 | 22 |
| 41.0 | 22 |
| 41.0 | 22 |
| 41.0 | 22 |
| 41.0 | 22 |
| 41.0 | 22 |
| 41.0 | 22 |
| 41.0 | 22 |
| 41.0 | 22 |
| 41.0 | 22 |
| 41.0 | 22 |
| 41.0 | 22 |
| 41.0 | 22 |
| 40.0 | 28 |
| 40.0 | 28 |
| 40.0 | 28 |
| 40.0 | 28 |
| 40.0 | 28 |
| 40.0 | 28 |
| 40.0 | 28 |
| 40.0 | 28 |
| 40.0 | 28 |
| 40.0 | 28 |
| 40.0 | 28 |
| 40.0 | 28 |
| 40.0 | 28 |
| 40.0 | 28 |
| 40.0 | 28 |
| 40.0 | 28 |
| 40.0 | 28 |
| 40.0 | 28 |
| 40.0 | 28 |
| 40.0 | 28 |
| 40.0 | 28 |
| 40.0 | 28 |
| 40.0 | 28 |
| 40.0 | 28 |
| 40.0 | 28 |
| 40.0 | 28 |
| 40.0 | 28 |
| 40.0 | 28 |
| 39.0 | 33 |
| 39.0 | 33 |
| 39.0 | 33 |
| 39.0 | 33 |
| 39.0 | 33 |
| 39.0 | 33 |
| 39.0 | 33 |
| 39.0 | 33 |
| 39.0 | 33 |
| 39.0 | 33 |
| 39.0 | 33 |
| 39.0 | 33 |
| 39.0 | 33 |
| 39.0 | 33 |
| 39.0 | 33 |
| 39.0 | 33 |
| 39.0 | 33 |
| 39.0 | 33 |
| 39.0 | 33 |
| 39.0 | 33 |
| 39.0 | 33 |
| 39.0 | 33 |
| 39.0 | 33 |
| 39.0 | 33 |
| 39.0 | 33 |
| 39.0 | 33 |
| 39.0 | 33 |
| 39.0 | 33 |
| 39.0 | 33 |
| 39.0 | 33 |
| 39.0 | 33 |
| 39.0 | 33 |
| 39.0 | 33 |
| 38.0 | 29 |
| 38.0 | 29 |
| 38.0 | 29 |
| 38.0 | 29 |
| 38.0 | 29 |
| 38.0 | 29 |
| 38.0 | 29 |
| 38.0 | 29 |
| 38.0 | 29 |
| 38.0 | 29 |
| 38.0 | 29 |
| 38.0 | 29 |
| 38.0 | 29 |
| 38.0 | 29 |
| 38.0 | 29 |
| 38.0 | 29 |
| 38.0 | 29 |
| 38.0 | 29 |
| 38.0 | 29 |
| 38.0 | 29 |
| 38.0 | 29 |
| 38.0 | 29 |
| 38.0 | 29 |
| 38.0 | 29 |
| 38.0 | 29 |
| 38.0 | 29 |
| 38.0 | 29 |
| 38.0 | 29 |
| 38.0 | 29 |
| 37.0 | 24 |
| 37.0 | 24 |
| 37.0 | 24 |
| 37.0 | 24 |
| 37.0 | 24 |
| 37.0 | 24 |
| 37.0 | 24 |
| 37.0 | 24 |
| 37.0 | 24 |
| 37.0 | 24 |
| 37.0 | 24 |
| 37.0 | 24 |
| 37.0 | 24 |
| 37.0 | 24 |
| 37.0 | 24 |
| 37.0 | 24 |
| 37.0 | 24 |
| 37.0 | 24 |
| 37.0 | 24 |
| 37.0 | 24 |
| 37.0 | 24 |
| 37.0 | 24 |
| 37.0 | 24 |
| 37.0 | 24 |
| 36.0 | 24 |
| 36.0 | 24 |
| 36.0 | 24 |
| 36.0 | 24 |
| 36.0 | 24 |
| 36.0 | 24 |
| 36.0 | 24 |
| 36.0 | 24 |
| 36.0 | 24 |
| 36.0 | 24 |
| 36.0 | 24 |
| 36.0 | 24 |
| 36.0 | 24 |
| 36.0 | 24 |
| 36.0 | 24 |
| 36.0 | 24 |
| 36.0 | 24 |
| 36.0 | 24 |
| 36.0 | 24 |
| 36.0 | 24 |
| 36.0 | 24 |
| 36.0 | 24 |
| 36.0 | 24 |
| 36.0 | 24 |
| 35.0 | 28 |
| 35.0 | 28 |
| 35.0 | 28 |
| 35.0 | 28 |
| 35.0 | 28 |
| 35.0 | 28 |
| 35.0 | 28 |
| 35.0 | 28 |
| 35.0 | 28 |
| 35.0 | 28 |
| 35.0 | 28 |
| 35.0 | 28 |
| 35.0 | 28 |
| 35.0 | 28 |
| 35.0 | 28 |
| 35.0 | 28 |
| 35.0 | 28 |
| 35.0 | 28 |
| 35.0 | 28 |
| 35.0 | 28 |
| 35.0 | 28 |
| 35.0 | 28 |
| 35.0 | 28 |
| 35.0 | 28 |
| 35.0 | 28 |
| 35.0 | 28 |
| 35.0 | 28 |
| 35.0 | 28 |
| 34.0 | 22 |
| 34.0 | 22 |
| 34.0 | 22 |
| 34.0 | 22 |
| 34.0 | 22 |
| 34.0 | 22 |
| 34.0 | 22 |
| 34.0 | 22 |
| 34.0 | 22 |
| 34.0 | 22 |
| 34.0 | 22 |
| 34.0 | 22 |
| 34.0 | 22 |
| 34.0 | 22 |
| 34.0 | 22 |
| 34.0 | 22 |
| 34.0 | 22 |
| 34.0 | 22 |
| 34.0 | 22 |
| 34.0 | 22 |
| 34.0 | 22 |
| 34.0 | 22 |
| 33.0 | 19 |
| 33.0 | 19 |
| 33.0 | 19 |
| 33.0 | 19 |
| 33.0 | 19 |
| 33.0 | 19 |
| 33.0 | 19 |
| 33.0 | 19 |
| 33.0 | 19 |
| 33.0 | 19 |
| 33.0 | 19 |
| 33.0 | 19 |
| 33.0 | 19 |
| 33.0 | 19 |
| 33.0 | 19 |
| 33.0 | 19 |
| 33.0 | 19 |
| 33.0 | 19 |
| 33.0 | 19 |
| 32.0 | 32 |
| 32.0 | 32 |
| 32.0 | 32 |
| 32.0 | 32 |
| 32.0 | 32 |
| 32.0 | 32 |
| 32.0 | 32 |
| 32.0 | 32 |
| 32.0 | 32 |
| 32.0 | 32 |
| 32.0 | 32 |
| 32.0 | 32 |
| 32.0 | 32 |
| 32.0 | 32 |
| 32.0 | 32 |
| 32.0 | 32 |
| 32.0 | 32 |
| 32.0 | 32 |
| 32.0 | 32 |
| 32.0 | 32 |
| 32.0 | 32 |
| 32.0 | 32 |
| 32.0 | 32 |
| 32.0 | 32 |
| 32.0 | 32 |
| 32.0 | 32 |
| 32.0 | 32 |
| 32.0 | 32 |
| 32.0 | 32 |
| 32.0 | 32 |
| 32.0 | 32 |
| 32.0 | 32 |
| 31.0 | 39 |
| 31.0 | 39 |
| 31.0 | 39 |
| 31.0 | 39 |
| 31.0 | 39 |
| 31.0 | 39 |
| 31.0 | 39 |
| 31.0 | 39 |
| 31.0 | 39 |
| 31.0 | 39 |
| 31.0 | 39 |
| 31.0 | 39 |
| 31.0 | 39 |
| 31.0 | 39 |
| 31.0 | 39 |
| 31.0 | 39 |
| 31.0 | 39 |
| 31.0 | 39 |
| 31.0 | 39 |
| 31.0 | 39 |
| 31.0 | 39 |
| 31.0 | 39 |
| 31.0 | 39 |
| 31.0 | 39 |
| 31.0 | 39 |
| 31.0 | 39 |
| 31.0 | 39 |
| 31.0 | 39 |
| 31.0 | 39 |
| 31.0 | 39 |
| 31.0 | 39 |
| 31.0 | 39 |
| 31.0 | 39 |
| 31.0 | 39 |
| 31.0 | 39 |
| 31.0 | 39 |
| 31.0 | 39 |
| 31.0 | 39 |
| 31.0 | 39 |
| 30.0 | 32 |
| 30.0 | 32 |
| 30.0 | 32 |
| 30.0 | 32 |
| 30.0 | 32 |
| 30.0 | 32 |
| 30.0 | 32 |
| 30.0 | 32 |
| 30.0 | 32 |
| 30.0 | 32 |
| 30.0 | 32 |
| 30.0 | 32 |
| 30.0 | 32 |
| 30.0 | 32 |
| 30.0 | 32 |
| 30.0 | 32 |
| 30.0 | 32 |
| 30.0 | 32 |
| 30.0 | 32 |
| 30.0 | 32 |
| 30.0 | 32 |
| 30.0 | 32 |
| 30.0 | 32 |
| 30.0 | 32 |
| 30.0 | 32 |
| 30.0 | 32 |
| 30.0 | 32 |
| 30.0 | 32 |
| 30.0 | 32 |
| 30.0 | 32 |
| 30.0 | 32 |
| 30.0 | 32 |
| 29.0 | 44 |
| 29.0 | 44 |
| 29.0 | 44 |
| 29.0 | 44 |
| 29.0 | 44 |
| 29.0 | 44 |
| 29.0 | 44 |
| 29.0 | 44 |
| 29.0 | 44 |
| 29.0 | 44 |
| 29.0 | 44 |
| 29.0 | 44 |
| 29.0 | 44 |
| 29.0 | 44 |
| 29.0 | 44 |
| 29.0 | 44 |
| 29.0 | 44 |
| 29.0 | 44 |
| 29.0 | 44 |
| 29.0 | 44 |
| 29.0 | 44 |
| 29.0 | 44 |
| 29.0 | 44 |
| 29.0 | 44 |
| 29.0 | 44 |
| 29.0 | 44 |
| 29.0 | 44 |
| 29.0 | 44 |
| 29.0 | 44 |
| 29.0 | 44 |
| 29.0 | 44 |
| 29.0 | 44 |
| 29.0 | 44 |
| 29.0 | 44 |
| 29.0 | 44 |
| 29.0 | 44 |
| 29.0 | 44 |
| 29.0 | 44 |
| 29.0 | 44 |
| 29.0 | 44 |
| 29.0 | 44 |
| 29.0 | 44 |
| 29.0 | 44 |
| 29.0 | 44 |
| 28.0 | 37 |
| 28.0 | 37 |
| 28.0 | 37 |
| 28.0 | 37 |
| 28.0 | 37 |
| 28.0 | 37 |
| 28.0 | 37 |
| 28.0 | 37 |
| 28.0 | 37 |
| 28.0 | 37 |
| 28.0 | 37 |
| 28.0 | 37 |
| 28.0 | 37 |
| 28.0 | 37 |
| 28.0 | 37 |
| 28.0 | 37 |
| 28.0 | 37 |
| 28.0 | 37 |
| 28.0 | 37 |
| 28.0 | 37 |
| 28.0 | 37 |
| 28.0 | 37 |
| 28.0 | 37 |
| 28.0 | 37 |
| 28.0 | 37 |
| 28.0 | 37 |
| 28.0 | 37 |
| 28.0 | 37 |
| 28.0 | 37 |
| 28.0 | 37 |
| 28.0 | 37 |
| 28.0 | 37 |
| 28.0 | 37 |
| 28.0 | 37 |
| 28.0 | 37 |
| 28.0 | 37 |
| 28.0 | 37 |
| 27.0 | 26 |
| 27.0 | 26 |
| 27.0 | 26 |
| 27.0 | 26 |
| 27.0 | 26 |
| 27.0 | 26 |
| 27.0 | 26 |
| 27.0 | 26 |
| 27.0 | 26 |
| 27.0 | 26 |
| 27.0 | 26 |
| 27.0 | 26 |
| 27.0 | 26 |
| 27.0 | 26 |
| 27.0 | 26 |
| 27.0 | 26 |
| 27.0 | 26 |
| 27.0 | 26 |
| 27.0 | 26 |
| 27.0 | 26 |
| 27.0 | 26 |
| 27.0 | 26 |
| 27.0 | 26 |
| 27.0 | 26 |
| 27.0 | 26 |
| 27.0 | 26 |
| 26.0 | 48 |
| 26.0 | 48 |
| 26.0 | 48 |
| 26.0 | 48 |
| 26.0 | 48 |
| 26.0 | 48 |
| 26.0 | 48 |
| 26.0 | 48 |
| 26.0 | 48 |
| 26.0 | 48 |
| 26.0 | 48 |
| 26.0 | 48 |
| 26.0 | 48 |
| 26.0 | 48 |
| 26.0 | 48 |
| 26.0 | 48 |
| 26.0 | 48 |
| 26.0 | 48 |
| 26.0 | 48 |
| 26.0 | 48 |
| 26.0 | 48 |
| 26.0 | 48 |
| 26.0 | 48 |
| 26.0 | 48 |
| 26.0 | 48 |
| 26.0 | 48 |
| 26.0 | 48 |
| 26.0 | 48 |
| 26.0 | 48 |
| 26.0 | 48 |
| 26.0 | 48 |
| 26.0 | 48 |
| 26.0 | 48 |
| 26.0 | 48 |
| 26.0 | 48 |
| 26.0 | 48 |
| 26.0 | 48 |
| 26.0 | 48 |
| 26.0 | 48 |
| 26.0 | 48 |
| 26.0 | 48 |
| 26.0 | 48 |
| 26.0 | 48 |
| 26.0 | 48 |
| 26.0 | 48 |
| 26.0 | 48 |
| 26.0 | 48 |
| 26.0 | 48 |
| 25.0 | 38 |
| 25.0 | 38 |
| 25.0 | 38 |
| 25.0 | 38 |
| 25.0 | 38 |
| 25.0 | 38 |
| 25.0 | 38 |
| 25.0 | 38 |
| 25.0 | 38 |
| 25.0 | 38 |
| 25.0 | 38 |
| 25.0 | 38 |
| 25.0 | 38 |
| 25.0 | 38 |
| 25.0 | 38 |
| 25.0 | 38 |
| 25.0 | 38 |
| 25.0 | 38 |
| 25.0 | 38 |
| 25.0 | 38 |
| 25.0 | 38 |
| 25.0 | 38 |
| 25.0 | 38 |
| 25.0 | 38 |
| 25.0 | 38 |
| 25.0 | 38 |
| 25.0 | 38 |
| 25.0 | 38 |
| 25.0 | 38 |
| 25.0 | 38 |
| 25.0 | 38 |
| 25.0 | 38 |
| 25.0 | 38 |
| 25.0 | 38 |
| 25.0 | 38 |
| 25.0 | 38 |
| 25.0 | 38 |
| 25.0 | 38 |
| 24.0 | 50 |
| 24.0 | 50 |
| 24.0 | 50 |
| 24.0 | 50 |
| 24.0 | 50 |
| 24.0 | 50 |
| 24.0 | 50 |
| 24.0 | 50 |
| 24.0 | 50 |
| 24.0 | 50 |
| 24.0 | 50 |
| 24.0 | 50 |
| 24.0 | 50 |
| 24.0 | 50 |
| 24.0 | 50 |
| 24.0 | 50 |
| 24.0 | 50 |
| 24.0 | 50 |
| 24.0 | 50 |
| 24.0 | 50 |
| 24.0 | 50 |
| 24.0 | 50 |
| 24.0 | 50 |
| 24.0 | 50 |
| 24.0 | 50 |
| 24.0 | 50 |
| 24.0 | 50 |
| 24.0 | 50 |
| 24.0 | 50 |
| 24.0 | 50 |
| 24.0 | 50 |
| 24.0 | 50 |
| 24.0 | 50 |
| 24.0 | 50 |
| 24.0 | 50 |
| 24.0 | 50 |
| 24.0 | 50 |
| 24.0 | 50 |
| 24.0 | 50 |
| 24.0 | 50 |
| 24.0 | 50 |
| 24.0 | 50 |
| 24.0 | 50 |
| 24.0 | 50 |
| 24.0 | 50 |
| 24.0 | 50 |
| 24.0 | 50 |
| 24.0 | 50 |
| 24.0 | 50 |
| 24.0 | 50 |
| 23.0 | 37 |
| 23.0 | 37 |
| 23.0 | 37 |
| 23.0 | 37 |
| 23.0 | 37 |
| 23.0 | 37 |
| 23.0 | 37 |
| 23.0 | 37 |
| 23.0 | 37 |
| 23.0 | 37 |
| 23.0 | 37 |
| 23.0 | 37 |
| 23.0 | 37 |
| 23.0 | 37 |
| 23.0 | 37 |
| 23.0 | 37 |
| 23.0 | 37 |
| 23.0 | 37 |
| 23.0 | 37 |
| 23.0 | 37 |
| 23.0 | 37 |
| 23.0 | 37 |
| 23.0 | 37 |
| 23.0 | 37 |
| 23.0 | 37 |
| 23.0 | 37 |
| 23.0 | 37 |
| 23.0 | 37 |
| 23.0 | 37 |
| 23.0 | 37 |
| 23.0 | 37 |
| 23.0 | 37 |
| 23.0 | 37 |
| 23.0 | 37 |
| 23.0 | 37 |
| 23.0 | 37 |
| 23.0 | 37 |
| 22.0 | 55 |
| 22.0 | 55 |
| 22.0 | 55 |
| 22.0 | 55 |
| 22.0 | 55 |
| 22.0 | 55 |
| 22.0 | 55 |
| 22.0 | 55 |
| 22.0 | 55 |
| 22.0 | 55 |
| 22.0 | 55 |
| 22.0 | 55 |
| 22.0 | 55 |
| 22.0 | 55 |
| 22.0 | 55 |
| 22.0 | 55 |
| 22.0 | 55 |
| 22.0 | 55 |
| 22.0 | 55 |
| 22.0 | 55 |
| 22.0 | 55 |
| 22.0 | 55 |
| 22.0 | 55 |
| 22.0 | 55 |
| 22.0 | 55 |
| 22.0 | 55 |
| 22.0 | 55 |
| 22.0 | 55 |
| 22.0 | 55 |
| 22.0 | 55 |
| 22.0 | 55 |
| 22.0 | 55 |
| 22.0 | 55 |
| 22.0 | 55 |
| 22.0 | 55 |
| 22.0 | 55 |
| 22.0 | 55 |
| 22.0 | 55 |
| 22.0 | 55 |
| 22.0 | 55 |
| 22.0 | 55 |
| 22.0 | 55 |
| 22.0 | 55 |
| 22.0 | 55 |
| 22.0 | 55 |
| 22.0 | 55 |
| 22.0 | 55 |
| 22.0 | 55 |
| 22.0 | 55 |
| 22.0 | 55 |
| 22.0 | 55 |
| 22.0 | 55 |
| 22.0 | 55 |
| 22.0 | 55 |
| 22.0 | 55 |
| 21.0 | 44 |
| 21.0 | 44 |
| 21.0 | 44 |
| 21.0 | 44 |
| 21.0 | 44 |
| 21.0 | 44 |
| 21.0 | 44 |
| 21.0 | 44 |
| 21.0 | 44 |
| 21.0 | 44 |
| 21.0 | 44 |
| 21.0 | 44 |
| 21.0 | 44 |
| 21.0 | 44 |
| 21.0 | 44 |
| 21.0 | 44 |
| 21.0 | 44 |
| 21.0 | 44 |
| 21.0 | 44 |
| 21.0 | 44 |
| 21.0 | 44 |
| 21.0 | 44 |
| 21.0 | 44 |
| 21.0 | 44 |
| 21.0 | 44 |
| 21.0 | 44 |
| 21.0 | 44 |
| 21.0 | 44 |
| 21.0 | 44 |
| 21.0 | 44 |
| 21.0 | 44 |
| 21.0 | 44 |
| 21.0 | 44 |
| 21.0 | 44 |
| 21.0 | 44 |
| 21.0 | 44 |
| 21.0 | 44 |
| 21.0 | 44 |
| 21.0 | 44 |
| 21.0 | 44 |
| 21.0 | 44 |
| 21.0 | 44 |
| 21.0 | 44 |
| 21.0 | 44 |
| 20.0 | 63 |
| 20.0 | 63 |
| 20.0 | 63 |
| 20.0 | 63 |
| 20.0 | 63 |
| 20.0 | 63 |
| 20.0 | 63 |
| 20.0 | 63 |
| 20.0 | 63 |
| 20.0 | 63 |
| 20.0 | 63 |
| 20.0 | 63 |
| 20.0 | 63 |
| 20.0 | 63 |
| 20.0 | 63 |
| 20.0 | 63 |
| 20.0 | 63 |
| 20.0 | 63 |
| 20.0 | 63 |
| 20.0 | 63 |
| 20.0 | 63 |
| 20.0 | 63 |
| 20.0 | 63 |
| 20.0 | 63 |
| 20.0 | 63 |
| 20.0 | 63 |
| 20.0 | 63 |
| 20.0 | 63 |
| 20.0 | 63 |
| 20.0 | 63 |
| 20.0 | 63 |
| 20.0 | 63 |
| 20.0 | 63 |
| 20.0 | 63 |
| 20.0 | 63 |
| 20.0 | 63 |
| 20.0 | 63 |
| 20.0 | 63 |
| 20.0 | 63 |
| 20.0 | 63 |
| 20.0 | 63 |
| 20.0 | 63 |
| 20.0 | 63 |
| 20.0 | 63 |
| 20.0 | 63 |
| 20.0 | 63 |
| 20.0 | 63 |
| 20.0 | 63 |
| 20.0 | 63 |
| 20.0 | 63 |
| 20.0 | 63 |
| 20.0 | 63 |
| 20.0 | 63 |
| 20.0 | 63 |
| 20.0 | 63 |
| 20.0 | 63 |
| 20.0 | 63 |
| 20.0 | 63 |
| 20.0 | 63 |
| 20.0 | 63 |
| 19.0 | 63 |
| 19.0 | 63 |
| 19.0 | 63 |
| 19.0 | 63 |
| 19.0 | 63 |
| 19.0 | 63 |
| 19.0 | 63 |
| 19.0 | 63 |
| 19.0 | 63 |
| 19.0 | 63 |
| 19.0 | 63 |
| 19.0 | 63 |
| 19.0 | 63 |
| 19.0 | 63 |
| 19.0 | 63 |
| 19.0 | 63 |
| 19.0 | 63 |
| 19.0 | 63 |
| 19.0 | 63 |
| 19.0 | 63 |
| 19.0 | 63 |
| 19.0 | 63 |
| 19.0 | 63 |
| 19.0 | 63 |
| 19.0 | 63 |
| 19.0 | 63 |
| 19.0 | 63 |
| 19.0 | 63 |
| 19.0 | 63 |
| 19.0 | 63 |
| 19.0 | 63 |
| 19.0 | 63 |
| 19.0 | 63 |
| 19.0 | 63 |
| 19.0 | 63 |
| 19.0 | 63 |
| 19.0 | 63 |
| 19.0 | 63 |
| 19.0 | 63 |
| 19.0 | 63 |
| 19.0 | 63 |
| 19.0 | 63 |
| 19.0 | 63 |
| 19.0 | 63 |
| 19.0 | 63 |
| 19.0 | 63 |
| 19.0 | 63 |
| 19.0 | 63 |
| 19.0 | 63 |
| 19.0 | 63 |
| 19.0 | 63 |
| 19.0 | 63 |
| 19.0 | 63 |
| 19.0 | 63 |
| 19.0 | 63 |
| 19.0 | 63 |
| 19.0 | 63 |
| 19.0 | 63 |
| 19.0 | 63 |
| 19.0 | 63 |
| 19.0 | 63 |
| 19.0 | 63 |
| 19.0 | 63 |
| 18.0 | 67 |
| 18.0 | 67 |
| 18.0 | 67 |
| 18.0 | 67 |
| 18.0 | 67 |
| 18.0 | 67 |
| 18.0 | 67 |
| 18.0 | 67 |
| 18.0 | 67 |
| 18.0 | 67 |
| 18.0 | 67 |
| 18.0 | 67 |
| 18.0 | 67 |
| 18.0 | 67 |
| 18.0 | 67 |
| 18.0 | 67 |
| 18.0 | 67 |
| 18.0 | 67 |
| 18.0 | 67 |
| 18.0 | 67 |
| 18.0 | 67 |
| 18.0 | 67 |
| 18.0 | 67 |
| 18.0 | 67 |
| 18.0 | 67 |
| 18.0 | 67 |
| 18.0 | 67 |
| 18.0 | 67 |
| 18.0 | 67 |
| 18.0 | 67 |
| 18.0 | 67 |
| 18.0 | 67 |
| 18.0 | 67 |
| 18.0 | 67 |
| 18.0 | 67 |
| 18.0 | 67 |
| 18.0 | 67 |
| 18.0 | 67 |
| 18.0 | 67 |
| 18.0 | 67 |
| 18.0 | 67 |
| 18.0 | 67 |
| 18.0 | 67 |
| 18.0 | 67 |
| 18.0 | 67 |
| 18.0 | 67 |
| 18.0 | 67 |
| 18.0 | 67 |
| 18.0 | 67 |
| 18.0 | 67 |
| 18.0 | 67 |
| 18.0 | 67 |
| 18.0 | 67 |
| 18.0 | 67 |
| 18.0 | 67 |
| 18.0 | 67 |
| 18.0 | 67 |
| 18.0 | 67 |
| 18.0 | 67 |
| 18.0 | 67 |
| 18.0 | 67 |
| 18.0 | 67 |
| 18.0 | 67 |
| 18.0 | 67 |
| 18.0 | 67 |
| 18.0 | 67 |
| 18.0 | 67 |
| 17.0 | 71 |
| 17.0 | 71 |
| 17.0 | 71 |
| 17.0 | 71 |
| 17.0 | 71 |
| 17.0 | 71 |
| 17.0 | 71 |
| 17.0 | 71 |
| 17.0 | 71 |
| 17.0 | 71 |
| 17.0 | 71 |
| 17.0 | 71 |
| 17.0 | 71 |
| 17.0 | 71 |
| 17.0 | 71 |
| 17.0 | 71 |
| 17.0 | 71 |
| 17.0 | 71 |
| 17.0 | 71 |
| 17.0 | 71 |
| 17.0 | 71 |
| 17.0 | 71 |
| 17.0 | 71 |
| 17.0 | 71 |
| 17.0 | 71 |
| 17.0 | 71 |
| 17.0 | 71 |
| 17.0 | 71 |
| 17.0 | 71 |
| 17.0 | 71 |
| 17.0 | 71 |
| 17.0 | 71 |
| 17.0 | 71 |
| 17.0 | 71 |
| 17.0 | 71 |
| 17.0 | 71 |
| 17.0 | 71 |
| 17.0 | 71 |
| 17.0 | 71 |
| 17.0 | 71 |
| 17.0 | 71 |
| 17.0 | 71 |
| 17.0 | 71 |
| 17.0 | 71 |
| 17.0 | 71 |
| 17.0 | 71 |
| 17.0 | 71 |
| 17.0 | 71 |
| 17.0 | 71 |
| 17.0 | 71 |
| 17.0 | 71 |
| 17.0 | 71 |
| 17.0 | 71 |
| 17.0 | 71 |
| 17.0 | 71 |
| 17.0 | 71 |
| 17.0 | 71 |
| 17.0 | 71 |
| 17.0 | 71 |
| 17.0 | 71 |
| 17.0 | 71 |
| 17.0 | 71 |
| 17.0 | 71 |
| 17.0 | 71 |
| 17.0 | 71 |
| 17.0 | 71 |
| 17.0 | 71 |
| 17.0 | 71 |
| 17.0 | 71 |
| 17.0 | 71 |
| 17.0 | 71 |
| 16.0 | 66 |
| 16.0 | 66 |
| 16.0 | 66 |
| 16.0 | 66 |
| 16.0 | 66 |
| 16.0 | 66 |
| 16.0 | 66 |
| 16.0 | 66 |
| 16.0 | 66 |
| 16.0 | 66 |
| 16.0 | 66 |
| 16.0 | 66 |
| 16.0 | 66 |
| 16.0 | 66 |
| 16.0 | 66 |
| 16.0 | 66 |
| 16.0 | 66 |
| 16.0 | 66 |
| 16.0 | 66 |
| 16.0 | 66 |
| 16.0 | 66 |
| 16.0 | 66 |
| 16.0 | 66 |
| 16.0 | 66 |
| 16.0 | 66 |
| 16.0 | 66 |
| 16.0 | 66 |
| 16.0 | 66 |
| 16.0 | 66 |
| 16.0 | 66 |
| 16.0 | 66 |
| 16.0 | 66 |
| 16.0 | 66 |
| 16.0 | 66 |
| 16.0 | 66 |
| 16.0 | 66 |
| 16.0 | 66 |
| 16.0 | 66 |
| 16.0 | 66 |
| 16.0 | 66 |
| 16.0 | 66 |
| 16.0 | 66 |
| 16.0 | 66 |
| 16.0 | 66 |
| 16.0 | 66 |
| 16.0 | 66 |
| 16.0 | 66 |
| 16.0 | 66 |
| 16.0 | 66 |
| 16.0 | 66 |
| 16.0 | 66 |
| 16.0 | 66 |
| 16.0 | 66 |
| 16.0 | 66 |
| 16.0 | 66 |
| 16.0 | 66 |
| 16.0 | 66 |
| 16.0 | 66 |
| 16.0 | 66 |
| 16.0 | 66 |
| 16.0 | 66 |
| 16.0 | 66 |
| 16.0 | 66 |
| 16.0 | 66 |
| 16.0 | 66 |
| 16.0 | 66 |
| 15.0 | 71 |
| 15.0 | 71 |
| 15.0 | 71 |
| 15.0 | 71 |
| 15.0 | 71 |
| 15.0 | 71 |
| 15.0 | 71 |
| 15.0 | 71 |
| 15.0 | 71 |
| 15.0 | 71 |
| 15.0 | 71 |
| 15.0 | 71 |
| 15.0 | 71 |
| 15.0 | 71 |
| 15.0 | 71 |
| 15.0 | 71 |
| 15.0 | 71 |
| 15.0 | 71 |
| 15.0 | 71 |
| 15.0 | 71 |
| 15.0 | 71 |
| 15.0 | 71 |
| 15.0 | 71 |
| 15.0 | 71 |
| 15.0 | 71 |
| 15.0 | 71 |
| 15.0 | 71 |
| 15.0 | 71 |
| 15.0 | 71 |
| 15.0 | 71 |
| 15.0 | 71 |
| 15.0 | 71 |
| 15.0 | 71 |
| 15.0 | 71 |
| 15.0 | 71 |
| 15.0 | 71 |
| 15.0 | 71 |
| 15.0 | 71 |
| 15.0 | 71 |
| 15.0 | 71 |
| 15.0 | 71 |
| 15.0 | 71 |
| 15.0 | 71 |
| 15.0 | 71 |
| 15.0 | 71 |
| 15.0 | 71 |
| 15.0 | 71 |
| 15.0 | 71 |
| 15.0 | 71 |
| 15.0 | 71 |
| 15.0 | 71 |
| 15.0 | 71 |
| 15.0 | 71 |
| 15.0 | 71 |
| 15.0 | 71 |
| 15.0 | 71 |
| 15.0 | 71 |
| 15.0 | 71 |
| 15.0 | 71 |
| 15.0 | 71 |
| 15.0 | 71 |
| 15.0 | 71 |
| 15.0 | 71 |
| 15.0 | 71 |
| 15.0 | 71 |
| 15.0 | 71 |
| 15.0 | 71 |
| 15.0 | 71 |
| 15.0 | 71 |
| 15.0 | 71 |
| 15.0 | 71 |
| 14.0 | 76 |
| 14.0 | 76 |
| 14.0 | 76 |
| 14.0 | 76 |
| 14.0 | 76 |
| 14.0 | 76 |
| 14.0 | 76 |
| 14.0 | 76 |
| 14.0 | 76 |
| 14.0 | 76 |
| 14.0 | 76 |
| 14.0 | 76 |
| 14.0 | 76 |
| 14.0 | 76 |
| 14.0 | 76 |
| 14.0 | 76 |
| 14.0 | 76 |
| 14.0 | 76 |
| 14.0 | 76 |
| 14.0 | 76 |
| 14.0 | 76 |
| 14.0 | 76 |
| 14.0 | 76 |
| 14.0 | 76 |
| 14.0 | 76 |
| 14.0 | 76 |
| 14.0 | 76 |
| 14.0 | 76 |
| 14.0 | 76 |
| 14.0 | 76 |
| 14.0 | 76 |
| 14.0 | 76 |
| 14.0 | 76 |
| 14.0 | 76 |
| 14.0 | 76 |
| 14.0 | 76 |
| 14.0 | 76 |
| 14.0 | 76 |
| 14.0 | 76 |
| 14.0 | 76 |
| 14.0 | 76 |
| 14.0 | 76 |
| 14.0 | 76 |
| 14.0 | 76 |
| 14.0 | 76 |
| 14.0 | 76 |
| 14.0 | 76 |
| 14.0 | 76 |
| 14.0 | 76 |
| 14.0 | 76 |
| 14.0 | 76 |
| 14.0 | 76 |
| 14.0 | 76 |
| 14.0 | 76 |
| 14.0 | 76 |
| 14.0 | 76 |
| 14.0 | 76 |
| 14.0 | 76 |
| 14.0 | 76 |
| 14.0 | 76 |
| 14.0 | 76 |
| 14.0 | 76 |
| 14.0 | 76 |
| 14.0 | 76 |
| 14.0 | 76 |
| 14.0 | 76 |
| 14.0 | 76 |
| 14.0 | 76 |
| 14.0 | 76 |
| 14.0 | 76 |
| 14.0 | 76 |
| 14.0 | 76 |
| 14.0 | 76 |
| 14.0 | 76 |
| 14.0 | 76 |
| 14.0 | 76 |
| 13.0 | 72 |
| 13.0 | 72 |
| 13.0 | 72 |
| 13.0 | 72 |
| 13.0 | 72 |
| 13.0 | 72 |
| 13.0 | 72 |
| 13.0 | 72 |
| 13.0 | 72 |
| 13.0 | 72 |
| 13.0 | 72 |
| 13.0 | 72 |
| 13.0 | 72 |
| 13.0 | 72 |
| 13.0 | 72 |
| 13.0 | 72 |
| 13.0 | 72 |
| 13.0 | 72 |
| 13.0 | 72 |
| 13.0 | 72 |
| 13.0 | 72 |
| 13.0 | 72 |
| 13.0 | 72 |
| 13.0 | 72 |
| 13.0 | 72 |
| 13.0 | 72 |
| 13.0 | 72 |
| 13.0 | 72 |
| 13.0 | 72 |
| 13.0 | 72 |
| 13.0 | 72 |
| 13.0 | 72 |
| 13.0 | 72 |
| 13.0 | 72 |
| 13.0 | 72 |
| 13.0 | 72 |
| 13.0 | 72 |
| 13.0 | 72 |
| 13.0 | 72 |
| 13.0 | 72 |
| 13.0 | 72 |
| 13.0 | 72 |
| 13.0 | 72 |
| 13.0 | 72 |
| 13.0 | 72 |
| 13.0 | 72 |
| 13.0 | 72 |
| 13.0 | 72 |
| 13.0 | 72 |
| 13.0 | 72 |
| 13.0 | 72 |
| 13.0 | 72 |
| 13.0 | 72 |
| 13.0 | 72 |
| 13.0 | 72 |
| 13.0 | 72 |
| 13.0 | 72 |
| 13.0 | 72 |
| 13.0 | 72 |
| 13.0 | 72 |
| 13.0 | 72 |
| 13.0 | 72 |
| 13.0 | 72 |
| 13.0 | 72 |
| 13.0 | 72 |
| 13.0 | 72 |
| 13.0 | 72 |
| 13.0 | 72 |
| 13.0 | 72 |
| 13.0 | 72 |
| 13.0 | 72 |
| 13.0 | 72 |
| 12.0 | 92 |
| 12.0 | 92 |
| 12.0 | 92 |
| 12.0 | 92 |
| 12.0 | 92 |
| 12.0 | 92 |
| 12.0 | 92 |
| 12.0 | 92 |
| 12.0 | 92 |
| 12.0 | 92 |
| 12.0 | 92 |
| 12.0 | 92 |
| 12.0 | 92 |
| 12.0 | 92 |
| 12.0 | 92 |
| 12.0 | 92 |
| 12.0 | 92 |
| 12.0 | 92 |
| 12.0 | 92 |
| 12.0 | 92 |
| 12.0 | 92 |
| 12.0 | 92 |
| 12.0 | 92 |
| 12.0 | 92 |
| 12.0 | 92 |
| 12.0 | 92 |
| 12.0 | 92 |
| 12.0 | 92 |
| 12.0 | 92 |
| 12.0 | 92 |
| 12.0 | 92 |
| 12.0 | 92 |
| 12.0 | 92 |
| 12.0 | 92 |
| 12.0 | 92 |
| 12.0 | 92 |
| 12.0 | 92 |
| 12.0 | 92 |
| 12.0 | 92 |
| 12.0 | 92 |
| 12.0 | 92 |
| 12.0 | 92 |
| 12.0 | 92 |
| 12.0 | 92 |
| 12.0 | 92 |
| 12.0 | 92 |
| 12.0 | 92 |
| 12.0 | 92 |
| 12.0 | 92 |
| 12.0 | 92 |
| 12.0 | 92 |
| 12.0 | 92 |
| 12.0 | 92 |
| 12.0 | 92 |
| 12.0 | 92 |
| 12.0 | 92 |
| 12.0 | 92 |
| 12.0 | 92 |
| 12.0 | 92 |
| 12.0 | 92 |
| 12.0 | 92 |
| 12.0 | 92 |
| 12.0 | 92 |
| 12.0 | 92 |
| 12.0 | 92 |
| 12.0 | 92 |
| 12.0 | 92 |
| 12.0 | 92 |
| 12.0 | 92 |
| 12.0 | 92 |
| 12.0 | 92 |
| 12.0 | 92 |
| 12.0 | 92 |
| 12.0 | 92 |
| 12.0 | 92 |
| 12.0 | 92 |
| 12.0 | 92 |
| 12.0 | 92 |
| 12.0 | 92 |
| 12.0 | 92 |
| 12.0 | 92 |
| 12.0 | 92 |
| 12.0 | 92 |
| 12.0 | 92 |
| 12.0 | 92 |
| 12.0 | 92 |
| 12.0 | 92 |
| 12.0 | 92 |
| 12.0 | 92 |
| 12.0 | 92 |
| 12.0 | 92 |
| 12.0 | 92 |
| 11.0 | 80 |
| 11.0 | 80 |
| 11.0 | 80 |
| 11.0 | 80 |
| 11.0 | 80 |
| 11.0 | 80 |
| 11.0 | 80 |
| 11.0 | 80 |
| 11.0 | 80 |
| 11.0 | 80 |
| 11.0 | 80 |
| 11.0 | 80 |
| 11.0 | 80 |
| 11.0 | 80 |
| 11.0 | 80 |
| 11.0 | 80 |
| 11.0 | 80 |
| 11.0 | 80 |
| 11.0 | 80 |
| 11.0 | 80 |
| 11.0 | 80 |
| 11.0 | 80 |
| 11.0 | 80 |
| 11.0 | 80 |
| 11.0 | 80 |
| 11.0 | 80 |
| 11.0 | 80 |
| 11.0 | 80 |
| 11.0 | 80 |
| 11.0 | 80 |
| 11.0 | 80 |
| 11.0 | 80 |
| 11.0 | 80 |
| 11.0 | 80 |
| 11.0 | 80 |
| 11.0 | 80 |
| 11.0 | 80 |
| 11.0 | 80 |
| 11.0 | 80 |
| 11.0 | 80 |
| 11.0 | 80 |
| 11.0 | 80 |
| 11.0 | 80 |
| 11.0 | 80 |
| 11.0 | 80 |
| 11.0 | 80 |
| 11.0 | 80 |
| 11.0 | 80 |
| 11.0 | 80 |
| 11.0 | 80 |
| 11.0 | 80 |
| 11.0 | 80 |
| 11.0 | 80 |
| 11.0 | 80 |
| 11.0 | 80 |
| 11.0 | 80 |
| 11.0 | 80 |
| 11.0 | 80 |
| 11.0 | 80 |
| 11.0 | 80 |
| 11.0 | 80 |
| 11.0 | 80 |
| 11.0 | 80 |
| 11.0 | 80 |
| 11.0 | 80 |
| 11.0 | 80 |
| 11.0 | 80 |
| 11.0 | 80 |
| 11.0 | 80 |
| 11.0 | 80 |
| 11.0 | 80 |
| 11.0 | 80 |
| 11.0 | 80 |
| 11.0 | 80 |
| 11.0 | 80 |
| 11.0 | 80 |
| 11.0 | 80 |
| 11.0 | 80 |
| 11.0 | 80 |
| 11.0 | 80 |
| 10.0 | 108 |
| 10.0 | 108 |
| 10.0 | 108 |
| 10.0 | 108 |
| 10.0 | 108 |
| 10.0 | 108 |
| 10.0 | 108 |
| 10.0 | 108 |
| 10.0 | 108 |
| 10.0 | 108 |
| 10.0 | 108 |
| 10.0 | 108 |
| 10.0 | 108 |
| 10.0 | 108 |
| 10.0 | 108 |
| 10.0 | 108 |
| 10.0 | 108 |
| 10.0 | 108 |
| 10.0 | 108 |
| 10.0 | 108 |
| 10.0 | 108 |
| 10.0 | 108 |
| 10.0 | 108 |
| 10.0 | 108 |
| 10.0 | 108 |
| 10.0 | 108 |
| 10.0 | 108 |
| 10.0 | 108 |
| 10.0 | 108 |
| 10.0 | 108 |
| 10.0 | 108 |
| 10.0 | 108 |
| 10.0 | 108 |
| 10.0 | 108 |
| 10.0 | 108 |
| 10.0 | 108 |
| 10.0 | 108 |
| 10.0 | 108 |
| 10.0 | 108 |
| 10.0 | 108 |
| 10.0 | 108 |
| 10.0 | 108 |
| 10.0 | 108 |
| 10.0 | 108 |
| 10.0 | 108 |
| 10.0 | 108 |
| 10.0 | 108 |
| 10.0 | 108 |
| 10.0 | 108 |
| 10.0 | 108 |
| 10.0 | 108 |
| 10.0 | 108 |
| 10.0 | 108 |
| 10.0 | 108 |
| 10.0 | 108 |
| 10.0 | 108 |
| 10.0 | 108 |
| 10.0 | 108 |
| 10.0 | 108 |
| 10.0 | 108 |
| 10.0 | 108 |
| 10.0 | 108 |
| 10.0 | 108 |
| 10.0 | 108 |
| 10.0 | 108 |
| 10.0 | 108 |
| 10.0 | 108 |
| 10.0 | 108 |
| 10.0 | 108 |
| 10.0 | 108 |
| 10.0 | 108 |
| 10.0 | 108 |
| 10.0 | 108 |
| 10.0 | 108 |
| 10.0 | 108 |
| 10.0 | 108 |
| 10.0 | 108 |
| 10.0 | 108 |
| 10.0 | 108 |
| 10.0 | 108 |
| 10.0 | 108 |
| 10.0 | 108 |
| 10.0 | 108 |
| 10.0 | 108 |
| 10.0 | 108 |
| 10.0 | 108 |
| 10.0 | 108 |
| 10.0 | 108 |
| 10.0 | 108 |
| 10.0 | 108 |
| 10.0 | 108 |
| 10.0 | 108 |
| 10.0 | 108 |
| 10.0 | 108 |
| 10.0 | 108 |
| 10.0 | 108 |
| 10.0 | 108 |
| 10.0 | 108 |
| 10.0 | 108 |
| 10.0 | 108 |
| 10.0 | 108 |
| 10.0 | 108 |
| 10.0 | 108 |
| 10.0 | 108 |
| 10.0 | 108 |
| 10.0 | 108 |
| 10.0 | 108 |
| 10.0 | 108 |
| 9.0 | 94 |
| 9.0 | 94 |
| 9.0 | 94 |
| 9.0 | 94 |
| 9.0 | 94 |
| 9.0 | 94 |
| 9.0 | 94 |
| 9.0 | 94 |
| 9.0 | 94 |
| 9.0 | 94 |
| 9.0 | 94 |
| 9.0 | 94 |
| 9.0 | 94 |
| 9.0 | 94 |
| 9.0 | 94 |
| 9.0 | 94 |
| 9.0 | 94 |
| 9.0 | 94 |
| 9.0 | 94 |
| 9.0 | 94 |
| 9.0 | 94 |
| 9.0 | 94 |
| 9.0 | 94 |
| 9.0 | 94 |
| 9.0 | 94 |
| 9.0 | 94 |
| 9.0 | 94 |
| 9.0 | 94 |
| 9.0 | 94 |
| 9.0 | 94 |
| 9.0 | 94 |
| 9.0 | 94 |
| 9.0 | 94 |
| 9.0 | 94 |
| 9.0 | 94 |
| 9.0 | 94 |
| 9.0 | 94 |
| 9.0 | 94 |
| 9.0 | 94 |
| 9.0 | 94 |
| 9.0 | 94 |
| 9.0 | 94 |
| 9.0 | 94 |
| 9.0 | 94 |
| 9.0 | 94 |
| 9.0 | 94 |
| 9.0 | 94 |
| 9.0 | 94 |
| 9.0 | 94 |
| 9.0 | 94 |
| 9.0 | 94 |
| 9.0 | 94 |
| 9.0 | 94 |
| 9.0 | 94 |
| 9.0 | 94 |
| 9.0 | 94 |
| 9.0 | 94 |
| 9.0 | 94 |
| 9.0 | 94 |
| 9.0 | 94 |
| 9.0 | 94 |
| 9.0 | 94 |
| 9.0 | 94 |
| 9.0 | 94 |
| 9.0 | 94 |
| 9.0 | 94 |
| 9.0 | 94 |
| 9.0 | 94 |
| 9.0 | 94 |
| 9.0 | 94 |
| 9.0 | 94 |
| 9.0 | 94 |
| 9.0 | 94 |
| 9.0 | 94 |
| 9.0 | 94 |
| 9.0 | 94 |
| 9.0 | 94 |
| 9.0 | 94 |
| 9.0 | 94 |
| 9.0 | 94 |
| 9.0 | 94 |
| 9.0 | 94 |
| 9.0 | 94 |
| 9.0 | 94 |
| 9.0 | 94 |
| 9.0 | 94 |
| 9.0 | 94 |
| 9.0 | 94 |
| 9.0 | 94 |
| 9.0 | 94 |
| 9.0 | 94 |
| 9.0 | 94 |
| 9.0 | 94 |
| 9.0 | 94 |
| 8.0 | 140 |
| 8.0 | 140 |
| 8.0 | 140 |
| 8.0 | 140 |
| 8.0 | 140 |
| 8.0 | 140 |
| 8.0 | 140 |
| 8.0 | 140 |
| 8.0 | 140 |
| 8.0 | 140 |
| 8.0 | 140 |
| 8.0 | 140 |
| 8.0 | 140 |
| 8.0 | 140 |
| 8.0 | 140 |
| 8.0 | 140 |
| 8.0 | 140 |
| 8.0 | 140 |
| 8.0 | 140 |
| 8.0 | 140 |
| 8.0 | 140 |
| 8.0 | 140 |
| 8.0 | 140 |
| 8.0 | 140 |
| 8.0 | 140 |
| 8.0 | 140 |
| 8.0 | 140 |
| 8.0 | 140 |
| 8.0 | 140 |
| 8.0 | 140 |
| 8.0 | 140 |
| 8.0 | 140 |
| 8.0 | 140 |
| 8.0 | 140 |
| 8.0 | 140 |
| 8.0 | 140 |
| 8.0 | 140 |
| 8.0 | 140 |
| 8.0 | 140 |
| 8.0 | 140 |
| 8.0 | 140 |
| 8.0 | 140 |
| 8.0 | 140 |
| 8.0 | 140 |
| 8.0 | 140 |
| 8.0 | 140 |
| 8.0 | 140 |
| 8.0 | 140 |
| 8.0 | 140 |
| 8.0 | 140 |
| 8.0 | 140 |
| 8.0 | 140 |
| 8.0 | 140 |
| 8.0 | 140 |
| 8.0 | 140 |
| 8.0 | 140 |
| 8.0 | 140 |
| 8.0 | 140 |
| 8.0 | 140 |
| 8.0 | 140 |
| 8.0 | 140 |
| 8.0 | 140 |
| 8.0 | 140 |
| 8.0 | 140 |
| 8.0 | 140 |
| 8.0 | 140 |
| 8.0 | 140 |
| 8.0 | 140 |
| 8.0 | 140 |
| 8.0 | 140 |
| 8.0 | 140 |
| 8.0 | 140 |
| 8.0 | 140 |
| 8.0 | 140 |
| 8.0 | 140 |
| 8.0 | 140 |
| 8.0 | 140 |
| 8.0 | 140 |
| 8.0 | 140 |
| 8.0 | 140 |
| 8.0 | 140 |
| 8.0 | 140 |
| 8.0 | 140 |
| 8.0 | 140 |
| 8.0 | 140 |
| 8.0 | 140 |
| 8.0 | 140 |
| 8.0 | 140 |
| 8.0 | 140 |
| 8.0 | 140 |
| 8.0 | 140 |
| 8.0 | 140 |
| 8.0 | 140 |
| 8.0 | 140 |
| 8.0 | 140 |
| 8.0 | 140 |
| 8.0 | 140 |
| 8.0 | 140 |
| 8.0 | 140 |
| 8.0 | 140 |
| 8.0 | 140 |
| 8.0 | 140 |
| 8.0 | 140 |
| 8.0 | 140 |
| 8.0 | 140 |
| 8.0 | 140 |
| 8.0 | 140 |
| 8.0 | 140 |
| 8.0 | 140 |
| 8.0 | 140 |
| 8.0 | 140 |
| 8.0 | 140 |
| 8.0 | 140 |
| 8.0 | 140 |
| 8.0 | 140 |
| 8.0 | 140 |
| 8.0 | 140 |
| 8.0 | 140 |
| 8.0 | 140 |
| 8.0 | 140 |
| 8.0 | 140 |
| 8.0 | 140 |
| 8.0 | 140 |
| 8.0 | 140 |
| 8.0 | 140 |
| 8.0 | 140 |
| 8.0 | 140 |
| 8.0 | 140 |
| 8.0 | 140 |
| 8.0 | 140 |
| 8.0 | 140 |
| 8.0 | 140 |
| 8.0 | 140 |
| 8.0 | 140 |
| 8.0 | 140 |
| 8.0 | 140 |
| 8.0 | 140 |
| 8.0 | 140 |
| 8.0 | 140 |
| 8.0 | 140 |
| 7.0 | 127 |
| 7.0 | 127 |
| 7.0 | 127 |
| 7.0 | 127 |
| 7.0 | 127 |
| 7.0 | 127 |
| 7.0 | 127 |
| 7.0 | 127 |
| 7.0 | 127 |
| 7.0 | 127 |
| 7.0 | 127 |
| 7.0 | 127 |
| 7.0 | 127 |
| 7.0 | 127 |
| 7.0 | 127 |
| 7.0 | 127 |
| 7.0 | 127 |
| 7.0 | 127 |
| 7.0 | 127 |
| 7.0 | 127 |
| 7.0 | 127 |
| 7.0 | 127 |
| 7.0 | 127 |
| 7.0 | 127 |
| 7.0 | 127 |
| 7.0 | 127 |
| 7.0 | 127 |
| 7.0 | 127 |
| 7.0 | 127 |
| 7.0 | 127 |
| 7.0 | 127 |
| 7.0 | 127 |
| 7.0 | 127 |
| 7.0 | 127 |
| 7.0 | 127 |
| 7.0 | 127 |
| 7.0 | 127 |
| 7.0 | 127 |
| 7.0 | 127 |
| 7.0 | 127 |
| 7.0 | 127 |
| 7.0 | 127 |
| 7.0 | 127 |
| 7.0 | 127 |
| 7.0 | 127 |
| 7.0 | 127 |
| 7.0 | 127 |
| 7.0 | 127 |
| 7.0 | 127 |
| 7.0 | 127 |
| 7.0 | 127 |
| 7.0 | 127 |
| 7.0 | 127 |
| 7.0 | 127 |
| 7.0 | 127 |
| 7.0 | 127 |
| 7.0 | 127 |
| 7.0 | 127 |
| 7.0 | 127 |
| 7.0 | 127 |
| 7.0 | 127 |
| 7.0 | 127 |
| 7.0 | 127 |
| 7.0 | 127 |
| 7.0 | 127 |
| 7.0 | 127 |
| 7.0 | 127 |
| 7.0 | 127 |
| 7.0 | 127 |
| 7.0 | 127 |
| 7.0 | 127 |
| 7.0 | 127 |
| 7.0 | 127 |
| 7.0 | 127 |
| 7.0 | 127 |
| 7.0 | 127 |
| 7.0 | 127 |
| 7.0 | 127 |
| 7.0 | 127 |
| 7.0 | 127 |
| 7.0 | 127 |
| 7.0 | 127 |
| 7.0 | 127 |
| 7.0 | 127 |
| 7.0 | 127 |
| 7.0 | 127 |
| 7.0 | 127 |
| 7.0 | 127 |
| 7.0 | 127 |
| 7.0 | 127 |
| 7.0 | 127 |
| 7.0 | 127 |
| 7.0 | 127 |
| 7.0 | 127 |
| 7.0 | 127 |
| 7.0 | 127 |
| 7.0 | 127 |
| 7.0 | 127 |
| 7.0 | 127 |
| 7.0 | 127 |
| 7.0 | 127 |
| 7.0 | 127 |
| 7.0 | 127 |
| 7.0 | 127 |
| 7.0 | 127 |
| 7.0 | 127 |
| 7.0 | 127 |
| 7.0 | 127 |
| 7.0 | 127 |
| 7.0 | 127 |
| 7.0 | 127 |
| 7.0 | 127 |
| 7.0 | 127 |
| 7.0 | 127 |
| 7.0 | 127 |
| 7.0 | 127 |
| 7.0 | 127 |
| 7.0 | 127 |
| 7.0 | 127 |
| 7.0 | 127 |
| 7.0 | 127 |
| 7.0 | 127 |
| 7.0 | 127 |
| 7.0 | 127 |
| 7.0 | 127 |
| 7.0 | 127 |
| 7.0 | 127 |
| 6.0 | 159 |
| 6.0 | 159 |
| 6.0 | 159 |
| 6.0 | 159 |
| 6.0 | 159 |
| 6.0 | 159 |
| 6.0 | 159 |
| 6.0 | 159 |
| 6.0 | 159 |
| 6.0 | 159 |
| 6.0 | 159 |
| 6.0 | 159 |
| 6.0 | 159 |
| 6.0 | 159 |
| 6.0 | 159 |
| 6.0 | 159 |
| 6.0 | 159 |
| 6.0 | 159 |
| 6.0 | 159 |
| 6.0 | 159 |
| 6.0 | 159 |
| 6.0 | 159 |
| 6.0 | 159 |
| 6.0 | 159 |
| 6.0 | 159 |
| 6.0 | 159 |
| 6.0 | 159 |
| 6.0 | 159 |
| 6.0 | 159 |
| 6.0 | 159 |
| 6.0 | 159 |
| 6.0 | 159 |
| 6.0 | 159 |
| 6.0 | 159 |
| 6.0 | 159 |
| 6.0 | 159 |
| 6.0 | 159 |
| 6.0 | 159 |
| 6.0 | 159 |
| 6.0 | 159 |
| 6.0 | 159 |
| 6.0 | 159 |
| 6.0 | 159 |
| 6.0 | 159 |
| 6.0 | 159 |
| 6.0 | 159 |
| 6.0 | 159 |
| 6.0 | 159 |
| 6.0 | 159 |
| 6.0 | 159 |
| 6.0 | 159 |
| 6.0 | 159 |
| 6.0 | 159 |
| 6.0 | 159 |
| 6.0 | 159 |
| 6.0 | 159 |
| 6.0 | 159 |
| 6.0 | 159 |
| 6.0 | 159 |
| 6.0 | 159 |
| 6.0 | 159 |
| 6.0 | 159 |
| 6.0 | 159 |
| 6.0 | 159 |
| 6.0 | 159 |
| 6.0 | 159 |
| 6.0 | 159 |
| 6.0 | 159 |
| 6.0 | 159 |
| 6.0 | 159 |
| 6.0 | 159 |
| 6.0 | 159 |
| 6.0 | 159 |
| 6.0 | 159 |
| 6.0 | 159 |
| 6.0 | 159 |
| 6.0 | 159 |
| 6.0 | 159 |
| 6.0 | 159 |
| 6.0 | 159 |
| 6.0 | 159 |
| 6.0 | 159 |
| 6.0 | 159 |
| 6.0 | 159 |
| 6.0 | 159 |
| 6.0 | 159 |
| 6.0 | 159 |
| 6.0 | 159 |
| 6.0 | 159 |
| 6.0 | 159 |
| 6.0 | 159 |
| 6.0 | 159 |
| 6.0 | 159 |
| 6.0 | 159 |
| 6.0 | 159 |
| 6.0 | 159 |
| 6.0 | 159 |
| 6.0 | 159 |
| 6.0 | 159 |
| 6.0 | 159 |
| 6.0 | 159 |
| 6.0 | 159 |
| 6.0 | 159 |
| 6.0 | 159 |
| 6.0 | 159 |
| 6.0 | 159 |
| 6.0 | 159 |
| 6.0 | 159 |
| 6.0 | 159 |
| 6.0 | 159 |
| 6.0 | 159 |
| 6.0 | 159 |
| 6.0 | 159 |
| 6.0 | 159 |
| 6.0 | 159 |
| 6.0 | 159 |
| 6.0 | 159 |
| 6.0 | 159 |
| 6.0 | 159 |
| 6.0 | 159 |
| 6.0 | 159 |
| 6.0 | 159 |
| 6.0 | 159 |
| 6.0 | 159 |
| 6.0 | 159 |
| 6.0 | 159 |
| 6.0 | 159 |
| 6.0 | 159 |
| 6.0 | 159 |
| 6.0 | 159 |
| 6.0 | 159 |
| 6.0 | 159 |
| 6.0 | 159 |
| 6.0 | 159 |
| 6.0 | 159 |
| 6.0 | 159 |
| 6.0 | 159 |
| 6.0 | 159 |
| 6.0 | 159 |
| 6.0 | 159 |
| 6.0 | 159 |
| 6.0 | 159 |
| 6.0 | 159 |
| 6.0 | 159 |
| 6.0 | 159 |
| 6.0 | 159 |
| 6.0 | 159 |
| 6.0 | 159 |
| 6.0 | 159 |
| 6.0 | 159 |
| 6.0 | 159 |
| 6.0 | 159 |
| 6.0 | 159 |
| 6.0 | 159 |
| 6.0 | 159 |
| 6.0 | 159 |
| 6.0 | 159 |
| 6.0 | 159 |
| 6.0 | 159 |
| 5.0 | 194 |
| 5.0 | 194 |
| 5.0 | 194 |
| 5.0 | 194 |
| 5.0 | 194 |
| 5.0 | 194 |
| 5.0 | 194 |
| 5.0 | 194 |
| 5.0 | 194 |
| 5.0 | 194 |
| 5.0 | 194 |
| 5.0 | 194 |
| 5.0 | 194 |
| 5.0 | 194 |
| 5.0 | 194 |
| 5.0 | 194 |
| 5.0 | 194 |
| 5.0 | 194 |
| 5.0 | 194 |
| 5.0 | 194 |
| 5.0 | 194 |
| 5.0 | 194 |
| 5.0 | 194 |
| 5.0 | 194 |
| 5.0 | 194 |
| 5.0 | 194 |
| 5.0 | 194 |
| 5.0 | 194 |
| 5.0 | 194 |
| 5.0 | 194 |
| 5.0 | 194 |
| 5.0 | 194 |
| 5.0 | 194 |
| 5.0 | 194 |
| 5.0 | 194 |
| 5.0 | 194 |
| 5.0 | 194 |
| 5.0 | 194 |
| 5.0 | 194 |
| 5.0 | 194 |
| 5.0 | 194 |
| 5.0 | 194 |
| 5.0 | 194 |
| 5.0 | 194 |
| 5.0 | 194 |
| 5.0 | 194 |
| 5.0 | 194 |
| 5.0 | 194 |
| 5.0 | 194 |
| 5.0 | 194 |
| 5.0 | 194 |
| 5.0 | 194 |
| 5.0 | 194 |
| 5.0 | 194 |
| 5.0 | 194 |
| 5.0 | 194 |
| 5.0 | 194 |
| 5.0 | 194 |
| 5.0 | 194 |
| 5.0 | 194 |
| 5.0 | 194 |
| 5.0 | 194 |
| 5.0 | 194 |
| 5.0 | 194 |
| 5.0 | 194 |
| 5.0 | 194 |
| 5.0 | 194 |
| 5.0 | 194 |
| 5.0 | 194 |
| 5.0 | 194 |
| 5.0 | 194 |
| 5.0 | 194 |
| 5.0 | 194 |
| 5.0 | 194 |
| 5.0 | 194 |
| 5.0 | 194 |
| 5.0 | 194 |
| 5.0 | 194 |
| 5.0 | 194 |
| 5.0 | 194 |
| 5.0 | 194 |
| 5.0 | 194 |
| 5.0 | 194 |
| 5.0 | 194 |
| 5.0 | 194 |
| 5.0 | 194 |
| 5.0 | 194 |
| 5.0 | 194 |
| 5.0 | 194 |
| 5.0 | 194 |
| 5.0 | 194 |
| 5.0 | 194 |
| 5.0 | 194 |
| 5.0 | 194 |
| 5.0 | 194 |
| 5.0 | 194 |
| 5.0 | 194 |
| 5.0 | 194 |
| 5.0 | 194 |
| 5.0 | 194 |
| 5.0 | 194 |
| 5.0 | 194 |
| 5.0 | 194 |
| 5.0 | 194 |
| 5.0 | 194 |
| 5.0 | 194 |
| 5.0 | 194 |
| 5.0 | 194 |
| 5.0 | 194 |
| 5.0 | 194 |
| 5.0 | 194 |
| 5.0 | 194 |
| 5.0 | 194 |
| 5.0 | 194 |
| 5.0 | 194 |
| 5.0 | 194 |
| 5.0 | 194 |
| 5.0 | 194 |
| 5.0 | 194 |
| 5.0 | 194 |
| 5.0 | 194 |
| 5.0 | 194 |
| 5.0 | 194 |
| 5.0 | 194 |
| 5.0 | 194 |
| 5.0 | 194 |
| 5.0 | 194 |
| 5.0 | 194 |
| 5.0 | 194 |
| 5.0 | 194 |
| 5.0 | 194 |
| 5.0 | 194 |
| 5.0 | 194 |
| 5.0 | 194 |
| 5.0 | 194 |
| 5.0 | 194 |
| 5.0 | 194 |
| 5.0 | 194 |
| 5.0 | 194 |
| 5.0 | 194 |
| 5.0 | 194 |
| 5.0 | 194 |
| 5.0 | 194 |
| 5.0 | 194 |
| 5.0 | 194 |
| 5.0 | 194 |
| 5.0 | 194 |
| 5.0 | 194 |
| 5.0 | 194 |
| 5.0 | 194 |
| 5.0 | 194 |
| 5.0 | 194 |
| 5.0 | 194 |
| 5.0 | 194 |
| 5.0 | 194 |
| 5.0 | 194 |
| 5.0 | 194 |
| 5.0 | 194 |
| 5.0 | 194 |
| 5.0 | 194 |
| 5.0 | 194 |
| 5.0 | 194 |
| 5.0 | 194 |
| 5.0 | 194 |
| 5.0 | 194 |
| 5.0 | 194 |
| 5.0 | 194 |
| 5.0 | 194 |
| 5.0 | 194 |
| 5.0 | 194 |
| 5.0 | 194 |
| 5.0 | 194 |
| 5.0 | 194 |
| 5.0 | 194 |
| 5.0 | 194 |
| 5.0 | 194 |
| 5.0 | 194 |
| 5.0 | 194 |
| 5.0 | 194 |
| 5.0 | 194 |
| 5.0 | 194 |
| 5.0 | 194 |
| 5.0 | 194 |
| 5.0 | 194 |
| 5.0 | 194 |
| 5.0 | 194 |
| 5.0 | 194 |
| 5.0 | 194 |
| 5.0 | 194 |
| 5.0 | 194 |
| 5.0 | 194 |
| 5.0 | 194 |
| 5.0 | 194 |
| 5.0 | 194 |
| 4.0 | 222 |
| 4.0 | 222 |
| 4.0 | 222 |
| 4.0 | 222 |
| 4.0 | 222 |
| 4.0 | 222 |
| 4.0 | 222 |
| 4.0 | 222 |
| 4.0 | 222 |
| 4.0 | 222 |
| 4.0 | 222 |
| 4.0 | 222 |
| 4.0 | 222 |
| 4.0 | 222 |
| 4.0 | 222 |
| 4.0 | 222 |
| 4.0 | 222 |
| 4.0 | 222 |
| 4.0 | 222 |
| 4.0 | 222 |
| 4.0 | 222 |
| 4.0 | 222 |
| 4.0 | 222 |
| 4.0 | 222 |
| 4.0 | 222 |
| 4.0 | 222 |
| 4.0 | 222 |
| 4.0 | 222 |
| 4.0 | 222 |
| 4.0 | 222 |
| 4.0 | 222 |
| 4.0 | 222 |
| 4.0 | 222 |
| 4.0 | 222 |
| 4.0 | 222 |
| 4.0 | 222 |
| 4.0 | 222 |
| 4.0 | 222 |
| 4.0 | 222 |
| 4.0 | 222 |
| 4.0 | 222 |
| 4.0 | 222 |
| 4.0 | 222 |
| 4.0 | 222 |
| 4.0 | 222 |
| 4.0 | 222 |
| 4.0 | 222 |
| 4.0 | 222 |
| 4.0 | 222 |
| 4.0 | 222 |
| 4.0 | 222 |
| 4.0 | 222 |
| 4.0 | 222 |
| 4.0 | 222 |
| 4.0 | 222 |
| 4.0 | 222 |
| 4.0 | 222 |
| 4.0 | 222 |
| 4.0 | 222 |
| 4.0 | 222 |
| 4.0 | 222 |
| 4.0 | 222 |
| 4.0 | 222 |
| 4.0 | 222 |
| 4.0 | 222 |
| 4.0 | 222 |
| 4.0 | 222 |
| 4.0 | 222 |
| 4.0 | 222 |
| 4.0 | 222 |
| 4.0 | 222 |
| 4.0 | 222 |
| 4.0 | 222 |
| 4.0 | 222 |
| 4.0 | 222 |
| 4.0 | 222 |
| 4.0 | 222 |
| 4.0 | 222 |
| 4.0 | 222 |
| 4.0 | 222 |
| 4.0 | 222 |
| 4.0 | 222 |
| 4.0 | 222 |
| 4.0 | 222 |
| 4.0 | 222 |
| 4.0 | 222 |
| 4.0 | 222 |
| 4.0 | 222 |
| 4.0 | 222 |
| 4.0 | 222 |
| 4.0 | 222 |
| 4.0 | 222 |
| 4.0 | 222 |
| 4.0 | 222 |
| 4.0 | 222 |
| 4.0 | 222 |
| 4.0 | 222 |
| 4.0 | 222 |
| 4.0 | 222 |
| 4.0 | 222 |
| 4.0 | 222 |
| 4.0 | 222 |
| 4.0 | 222 |
| 4.0 | 222 |
| 4.0 | 222 |
| 4.0 | 222 |
| 4.0 | 222 |
| 4.0 | 222 |
| 4.0 | 222 |
| 4.0 | 222 |
| 4.0 | 222 |
| 4.0 | 222 |
| 4.0 | 222 |
| 4.0 | 222 |
| 4.0 | 222 |
| 4.0 | 222 |
| 4.0 | 222 |
| 4.0 | 222 |
| 4.0 | 222 |
| 4.0 | 222 |
| 4.0 | 222 |
| 4.0 | 222 |
| 4.0 | 222 |
| 4.0 | 222 |
| 4.0 | 222 |
| 4.0 | 222 |
| 4.0 | 222 |
| 4.0 | 222 |
| 4.0 | 222 |
| 4.0 | 222 |
| 4.0 | 222 |
| 4.0 | 222 |
| 4.0 | 222 |
| 4.0 | 222 |
| 4.0 | 222 |
| 4.0 | 222 |
| 4.0 | 222 |
| 4.0 | 222 |
| 4.0 | 222 |
| 4.0 | 222 |
| 4.0 | 222 |
| 4.0 | 222 |
| 4.0 | 222 |
| 4.0 | 222 |
| 4.0 | 222 |
| 4.0 | 222 |
| 4.0 | 222 |
| 4.0 | 222 |
| 4.0 | 222 |
| 4.0 | 222 |
| 4.0 | 222 |
| 4.0 | 222 |
| 4.0 | 222 |
| 4.0 | 222 |
| 4.0 | 222 |
| 4.0 | 222 |
| 4.0 | 222 |
| 4.0 | 222 |
| 4.0 | 222 |
| 4.0 | 222 |
| 4.0 | 222 |
| 4.0 | 222 |
| 4.0 | 222 |
| 4.0 | 222 |
| 4.0 | 222 |
| 4.0 | 222 |
| 4.0 | 222 |
| 4.0 | 222 |
| 4.0 | 222 |
| 4.0 | 222 |
| 4.0 | 222 |
| 4.0 | 222 |
| 4.0 | 222 |
| 4.0 | 222 |
| 4.0 | 222 |
| 4.0 | 222 |
| 4.0 | 222 |
| 4.0 | 222 |
| 4.0 | 222 |
| 4.0 | 222 |
| 4.0 | 222 |
| 4.0 | 222 |
| 4.0 | 222 |
| 4.0 | 222 |
| 4.0 | 222 |
| 4.0 | 222 |
| 4.0 | 222 |
| 4.0 | 222 |
| 4.0 | 222 |
| 4.0 | 222 |
| 4.0 | 222 |
| 4.0 | 222 |
| 4.0 | 222 |
| 4.0 | 222 |
| 4.0 | 222 |
| 4.0 | 222 |
| 4.0 | 222 |
| 4.0 | 222 |
| 4.0 | 222 |
| 4.0 | 222 |
| 4.0 | 222 |
| 4.0 | 222 |
| 4.0 | 222 |
| 4.0 | 222 |
| 4.0 | 222 |
| 4.0 | 222 |
| 4.0 | 222 |
| 4.0 | 222 |
| 4.0 | 222 |
| 4.0 | 222 |
| 4.0 | 222 |
| 4.0 | 222 |
| 4.0 | 222 |
| 4.0 | 222 |
| 4.0 | 222 |
| 4.0 | 222 |
| 4.0 | 222 |
| 4.0 | 222 |
| 4.0 | 222 |
| 4.0 | 222 |
| 4.0 | 222 |
| 4.0 | 222 |
| 3.0 | 334 |
| 3.0 | 334 |
| 3.0 | 334 |
| 3.0 | 334 |
| 3.0 | 334 |
| 3.0 | 334 |
| 3.0 | 334 |
| 3.0 | 334 |
| 3.0 | 334 |
| 3.0 | 334 |
| 3.0 | 334 |
| 3.0 | 334 |
| 3.0 | 334 |
| 3.0 | 334 |
| 3.0 | 334 |
| 3.0 | 334 |
| 3.0 | 334 |
| 3.0 | 334 |
| 3.0 | 334 |
| 3.0 | 334 |
| 3.0 | 334 |
| 3.0 | 334 |
| 3.0 | 334 |
| 3.0 | 334 |
| 3.0 | 334 |
| 3.0 | 334 |
| 3.0 | 334 |
| 3.0 | 334 |
| 3.0 | 334 |
| 3.0 | 334 |
| 3.0 | 334 |
| 3.0 | 334 |
| 3.0 | 334 |
| 3.0 | 334 |
| 3.0 | 334 |
| 3.0 | 334 |
| 3.0 | 334 |
| 3.0 | 334 |
| 3.0 | 334 |
| 3.0 | 334 |
| 3.0 | 334 |
| 3.0 | 334 |
| 3.0 | 334 |
| 3.0 | 334 |
| 3.0 | 334 |
| 3.0 | 334 |
| 3.0 | 334 |
| 3.0 | 334 |
| 3.0 | 334 |
| 3.0 | 334 |
| 3.0 | 334 |
| 3.0 | 334 |
| 3.0 | 334 |
| 3.0 | 334 |
| 3.0 | 334 |
| 3.0 | 334 |
| 3.0 | 334 |
| 3.0 | 334 |
| 3.0 | 334 |
| 3.0 | 334 |
| 3.0 | 334 |
| 3.0 | 334 |
| 3.0 | 334 |
| 3.0 | 334 |
| 3.0 | 334 |
| 3.0 | 334 |
| 3.0 | 334 |
| 3.0 | 334 |
| 3.0 | 334 |
| 3.0 | 334 |
| 3.0 | 334 |
| 3.0 | 334 |
| 3.0 | 334 |
| 3.0 | 334 |
| 3.0 | 334 |
| 3.0 | 334 |
| 3.0 | 334 |
| 3.0 | 334 |
| 3.0 | 334 |
| 3.0 | 334 |
| 3.0 | 334 |
| 3.0 | 334 |
| 3.0 | 334 |
| 3.0 | 334 |
| 3.0 | 334 |
| 3.0 | 334 |
| 3.0 | 334 |
| 3.0 | 334 |
| 3.0 | 334 |
| 3.0 | 334 |
| 3.0 | 334 |
| 3.0 | 334 |
| 3.0 | 334 |
| 3.0 | 334 |
| 3.0 | 334 |
| 3.0 | 334 |
| 3.0 | 334 |
| 3.0 | 334 |
| 3.0 | 334 |
| 3.0 | 334 |
| 3.0 | 334 |
| 3.0 | 334 |
| 3.0 | 334 |
| 3.0 | 334 |
| 3.0 | 334 |
| 3.0 | 334 |
| 3.0 | 334 |
| 3.0 | 334 |
| 3.0 | 334 |
| 3.0 | 334 |
| 3.0 | 334 |
| 3.0 | 334 |
| 3.0 | 334 |
| 3.0 | 334 |
| 3.0 | 334 |
| 3.0 | 334 |
| 3.0 | 334 |
| 3.0 | 334 |
| 3.0 | 334 |
| 3.0 | 334 |
| 3.0 | 334 |
| 3.0 | 334 |
| 3.0 | 334 |
| 3.0 | 334 |
| 3.0 | 334 |
| 3.0 | 334 |
| 3.0 | 334 |
| 3.0 | 334 |
| 3.0 | 334 |
| 3.0 | 334 |
| 3.0 | 334 |
| 3.0 | 334 |
| 3.0 | 334 |
| 3.0 | 334 |
| 3.0 | 334 |
| 3.0 | 334 |
| 3.0 | 334 |
| 3.0 | 334 |
| 3.0 | 334 |
| 3.0 | 334 |
| 3.0 | 334 |
| 3.0 | 334 |
| 3.0 | 334 |
| 3.0 | 334 |
| 3.0 | 334 |
| 3.0 | 334 |
| 3.0 | 334 |
| 3.0 | 334 |
| 3.0 | 334 |
| 3.0 | 334 |
| 3.0 | 334 |
| 3.0 | 334 |
| 3.0 | 334 |
| 3.0 | 334 |
| 3.0 | 334 |
| 3.0 | 334 |
| 3.0 | 334 |
| 3.0 | 334 |
| 3.0 | 334 |
| 3.0 | 334 |
| 3.0 | 334 |
| 3.0 | 334 |
| 3.0 | 334 |
| 3.0 | 334 |
| 3.0 | 334 |
| 3.0 | 334 |
| 3.0 | 334 |
| 3.0 | 334 |
| 3.0 | 334 |
| 3.0 | 334 |
| 3.0 | 334 |
| 3.0 | 334 |
| 3.0 | 334 |
| 3.0 | 334 |
| 3.0 | 334 |
| 3.0 | 334 |
| 3.0 | 334 |
| 3.0 | 334 |
| 3.0 | 334 |
| 3.0 | 334 |
| 3.0 | 334 |
| 3.0 | 334 |
| 3.0 | 334 |
| 3.0 | 334 |
| 3.0 | 334 |
| 3.0 | 334 |
| 3.0 | 334 |
| 3.0 | 334 |
| 3.0 | 334 |
| 3.0 | 334 |
| 3.0 | 334 |
| 3.0 | 334 |
| 3.0 | 334 |
| 3.0 | 334 |
| 3.0 | 334 |
| 3.0 | 334 |
| 3.0 | 334 |
| 3.0 | 334 |
| 3.0 | 334 |
| 3.0 | 334 |
| 3.0 | 334 |
| 3.0 | 334 |
| 3.0 | 334 |
| 3.0 | 334 |
| 3.0 | 334 |
| 3.0 | 334 |
| 3.0 | 334 |
| 3.0 | 334 |
| 3.0 | 334 |
| 3.0 | 334 |
| 3.0 | 334 |
| 3.0 | 334 |
| 3.0 | 334 |
| 3.0 | 334 |
| 3.0 | 334 |
| 3.0 | 334 |
| 3.0 | 334 |
| 3.0 | 334 |
| 3.0 | 334 |
| 3.0 | 334 |
| 3.0 | 334 |
| 3.0 | 334 |
| 3.0 | 334 |
| 3.0 | 334 |
| 3.0 | 334 |
| 3.0 | 334 |
| 3.0 | 334 |
| 3.0 | 334 |
| 3.0 | 334 |
| 3.0 | 334 |
| 3.0 | 334 |
| 3.0 | 334 |
| 3.0 | 334 |
| 3.0 | 334 |
| 3.0 | 334 |
| 3.0 | 334 |
| 3.0 | 334 |
| 3.0 | 334 |
| 3.0 | 334 |
| 3.0 | 334 |
| 3.0 | 334 |
| 3.0 | 334 |
| 3.0 | 334 |
| 3.0 | 334 |
| 3.0 | 334 |
| 3.0 | 334 |
| 3.0 | 334 |
| 3.0 | 334 |
| 3.0 | 334 |
| 3.0 | 334 |
| 3.0 | 334 |
| 3.0 | 334 |
| 3.0 | 334 |
| 3.0 | 334 |
| 3.0 | 334 |
| 3.0 | 334 |
| 3.0 | 334 |
| 3.0 | 334 |
| 3.0 | 334 |
| 3.0 | 334 |
| 3.0 | 334 |
| 3.0 | 334 |
| 3.0 | 334 |
| 3.0 | 334 |
| 3.0 | 334 |
| 3.0 | 334 |
| 3.0 | 334 |
| 3.0 | 334 |
| 3.0 | 334 |
| 3.0 | 334 |
| 3.0 | 334 |
| 3.0 | 334 |
| 3.0 | 334 |
| 3.0 | 334 |
| 3.0 | 334 |
| 3.0 | 334 |
| 3.0 | 334 |
| 3.0 | 334 |
| 3.0 | 334 |
| 3.0 | 334 |
| 3.0 | 334 |
| 3.0 | 334 |
| 3.0 | 334 |
| 3.0 | 334 |
| 3.0 | 334 |
| 3.0 | 334 |
| 3.0 | 334 |
| 3.0 | 334 |
| 3.0 | 334 |
| 3.0 | 334 |
| 3.0 | 334 |
| 3.0 | 334 |
| 3.0 | 334 |
| 3.0 | 334 |
| 3.0 | 334 |
| 3.0 | 334 |
| 3.0 | 334 |
| 3.0 | 334 |
| 3.0 | 334 |
| 3.0 | 334 |
| 3.0 | 334 |
| 3.0 | 334 |
| 3.0 | 334 |
| 3.0 | 334 |
| 3.0 | 334 |
| 3.0 | 334 |
| 3.0 | 334 |
| 3.0 | 334 |
| 3.0 | 334 |
| 3.0 | 334 |
| 3.0 | 334 |
| 3.0 | 334 |
| 3.0 | 334 |
| 3.0 | 334 |
| 3.0 | 334 |
| 3.0 | 334 |
| 3.0 | 334 |
| 3.0 | 334 |
| 3.0 | 334 |
| 3.0 | 334 |
| 3.0 | 334 |
| 3.0 | 334 |
| 3.0 | 334 |
| 3.0 | 334 |
| 3.0 | 334 |
| 3.0 | 334 |
| 3.0 | 334 |
| 3.0 | 334 |
| 3.0 | 334 |
| 3.0 | 334 |
| 3.0 | 334 |
| 3.0 | 334 |
| 3.0 | 334 |
| 3.0 | 334 |
| 2.0 | 510 |
| 2.0 | 510 |
| 2.0 | 510 |
| 2.0 | 510 |
| 2.0 | 510 |
| 2.0 | 510 |
| 2.0 | 510 |
| 2.0 | 510 |
| 2.0 | 510 |
| 2.0 | 510 |
| 2.0 | 510 |
| 2.0 | 510 |
| 2.0 | 510 |
| 2.0 | 510 |
| 2.0 | 510 |
| 2.0 | 510 |
| 2.0 | 510 |
| 2.0 | 510 |
| 2.0 | 510 |
| 2.0 | 510 |
| 2.0 | 510 |
| 2.0 | 510 |
| 2.0 | 510 |
| 2.0 | 510 |
| 2.0 | 510 |
| 2.0 | 510 |
| 2.0 | 510 |
| 2.0 | 510 |
| 2.0 | 510 |
| 2.0 | 510 |
| 2.0 | 510 |
| 2.0 | 510 |
| 2.0 | 510 |
| 2.0 | 510 |
| 2.0 | 510 |
| 2.0 | 510 |
| 2.0 | 510 |
| 2.0 | 510 |
| 2.0 | 510 |
| 2.0 | 510 |
| 2.0 | 510 |
| 2.0 | 510 |
| 2.0 | 510 |
| 2.0 | 510 |
| 2.0 | 510 |
| 2.0 | 510 |
| 2.0 | 510 |
| 2.0 | 510 |
| 2.0 | 510 |
| 2.0 | 510 |
| 2.0 | 510 |
| 2.0 | 510 |
| 2.0 | 510 |
| 2.0 | 510 |
| 2.0 | 510 |
| 2.0 | 510 |
| 2.0 | 510 |
| 2.0 | 510 |
| 2.0 | 510 |
| 2.0 | 510 |
| 2.0 | 510 |
| 2.0 | 510 |
| 2.0 | 510 |
| 2.0 | 510 |
| 2.0 | 510 |
| 2.0 | 510 |
| 2.0 | 510 |
| 2.0 | 510 |
| 2.0 | 510 |
| 2.0 | 510 |
| 2.0 | 510 |
| 2.0 | 510 |
| 2.0 | 510 |
| 2.0 | 510 |
| 2.0 | 510 |
| 2.0 | 510 |
| 2.0 | 510 |
| 2.0 | 510 |
| 2.0 | 510 |
| 2.0 | 510 |
| 2.0 | 510 |
| 2.0 | 510 |
| 2.0 | 510 |
| 2.0 | 510 |
| 2.0 | 510 |
| 2.0 | 510 |
| 2.0 | 510 |
| 2.0 | 510 |
| 2.0 | 510 |
| 2.0 | 510 |
| 2.0 | 510 |
| 2.0 | 510 |
| 2.0 | 510 |
| 2.0 | 510 |
| 2.0 | 510 |
| 2.0 | 510 |
| 2.0 | 510 |
| 2.0 | 510 |
| 2.0 | 510 |
| 2.0 | 510 |
| 2.0 | 510 |
| 2.0 | 510 |
| 2.0 | 510 |
| 2.0 | 510 |
| 2.0 | 510 |
| 2.0 | 510 |
| 2.0 | 510 |
| 2.0 | 510 |
| 2.0 | 510 |
| 2.0 | 510 |
| 2.0 | 510 |
| 2.0 | 510 |
| 2.0 | 510 |
| 2.0 | 510 |
| 2.0 | 510 |
| 2.0 | 510 |
| 2.0 | 510 |
| 2.0 | 510 |
| 2.0 | 510 |
| 2.0 | 510 |
| 2.0 | 510 |
| 2.0 | 510 |
| 2.0 | 510 |
| 2.0 | 510 |
| 2.0 | 510 |
| 2.0 | 510 |
| 2.0 | 510 |
| 2.0 | 510 |
| 2.0 | 510 |
| 2.0 | 510 |
| 2.0 | 510 |
| 2.0 | 510 |
| 2.0 | 510 |
| 2.0 | 510 |
| 2.0 | 510 |
| 2.0 | 510 |
| 2.0 | 510 |
| 2.0 | 510 |
| 2.0 | 510 |
| 2.0 | 510 |
| 2.0 | 510 |
| 2.0 | 510 |
| 2.0 | 510 |
| 2.0 | 510 |
| 2.0 | 510 |
| 2.0 | 510 |
| 2.0 | 510 |
| 2.0 | 510 |
| 2.0 | 510 |
| 2.0 | 510 |
| 2.0 | 510 |
| 2.0 | 510 |
| 2.0 | 510 |
| 2.0 | 510 |
| 2.0 | 510 |
| 2.0 | 510 |
| 2.0 | 510 |
| 2.0 | 510 |
| 2.0 | 510 |
| 2.0 | 510 |
| 2.0 | 510 |
| 2.0 | 510 |
| 2.0 | 510 |
| 2.0 | 510 |
| 2.0 | 510 |
| 2.0 | 510 |
| 2.0 | 510 |
| 2.0 | 510 |
| 2.0 | 510 |
| 2.0 | 510 |
| 2.0 | 510 |
| 2.0 | 510 |
| 2.0 | 510 |
| 2.0 | 510 |
| 2.0 | 510 |
| 2.0 | 510 |
| 2.0 | 510 |
| 2.0 | 510 |
| 2.0 | 510 |
| 2.0 | 510 |
| 2.0 | 510 |
| 2.0 | 510 |
| 2.0 | 510 |
| 2.0 | 510 |
| 2.0 | 510 |
| 2.0 | 510 |
| 2.0 | 510 |
| 2.0 | 510 |
| 2.0 | 510 |
| 2.0 | 510 |
| 2.0 | 510 |
| 2.0 | 510 |
| 2.0 | 510 |
| 2.0 | 510 |
| 2.0 | 510 |
| 2.0 | 510 |
| 2.0 | 510 |
| 2.0 | 510 |
| 2.0 | 510 |
| 2.0 | 510 |
| 2.0 | 510 |
| 2.0 | 510 |
| 2.0 | 510 |
| 2.0 | 510 |
| 2.0 | 510 |
| 2.0 | 510 |
| 2.0 | 510 |
| 2.0 | 510 |
| 2.0 | 510 |
| 2.0 | 510 |
| 2.0 | 510 |
| 2.0 | 510 |
| 2.0 | 510 |
| 2.0 | 510 |
| 2.0 | 510 |
| 2.0 | 510 |
| 2.0 | 510 |
| 2.0 | 510 |
| 2.0 | 510 |
| 2.0 | 510 |
| 2.0 | 510 |
| 2.0 | 510 |
| 2.0 | 510 |
| 2.0 | 510 |
| 2.0 | 510 |
| 2.0 | 510 |
| 2.0 | 510 |
| 2.0 | 510 |
| 2.0 | 510 |
| 2.0 | 510 |
| 2.0 | 510 |
| 2.0 | 510 |
| 2.0 | 510 |
| 2.0 | 510 |
| 2.0 | 510 |
| 2.0 | 510 |
| 2.0 | 510 |
| 2.0 | 510 |
| 2.0 | 510 |
| 2.0 | 510 |
| 2.0 | 510 |
| 2.0 | 510 |
| 2.0 | 510 |
| 2.0 | 510 |
| 2.0 | 510 |
| 2.0 | 510 |
| 2.0 | 510 |
| 2.0 | 510 |
| 2.0 | 510 |
| 2.0 | 510 |
| 2.0 | 510 |
| 2.0 | 510 |
| 2.0 | 510 |
| 2.0 | 510 |
| 2.0 | 510 |
| 2.0 | 510 |
| 2.0 | 510 |
| 2.0 | 510 |
| 2.0 | 510 |
| 2.0 | 510 |
| 2.0 | 510 |
| 2.0 | 510 |
| 2.0 | 510 |
| 2.0 | 510 |
| 2.0 | 510 |
| 2.0 | 510 |
| 2.0 | 510 |
| 2.0 | 510 |
| 2.0 | 510 |
| 2.0 | 510 |
| 2.0 | 510 |
| 2.0 | 510 |
| 2.0 | 510 |
| 2.0 | 510 |
| 2.0 | 510 |
| 2.0 | 510 |
| 2.0 | 510 |
| 2.0 | 510 |
| 2.0 | 510 |
| 2.0 | 510 |
| 2.0 | 510 |
| 2.0 | 510 |
| 2.0 | 510 |
| 2.0 | 510 |
| 2.0 | 510 |
| 2.0 | 510 |
| 2.0 | 510 |
| 2.0 | 510 |
| 2.0 | 510 |
| 2.0 | 510 |
| 2.0 | 510 |
| 2.0 | 510 |
| 2.0 | 510 |
| 2.0 | 510 |
| 2.0 | 510 |
| 2.0 | 510 |
| 2.0 | 510 |
| 2.0 | 510 |
| 2.0 | 510 |
| 2.0 | 510 |
| 2.0 | 510 |
| 2.0 | 510 |
| 2.0 | 510 |
| 2.0 | 510 |
| 2.0 | 510 |
| 2.0 | 510 |
| 2.0 | 510 |
| 2.0 | 510 |
| 2.0 | 510 |
| 2.0 | 510 |
| 2.0 | 510 |
| 2.0 | 510 |
| 2.0 | 510 |
| 2.0 | 510 |
| 2.0 | 510 |
| 2.0 | 510 |
| 2.0 | 510 |
| 2.0 | 510 |
| 2.0 | 510 |
| 2.0 | 510 |
| 2.0 | 510 |
| 2.0 | 510 |
| 2.0 | 510 |
| 2.0 | 510 |
| 2.0 | 510 |
| 2.0 | 510 |
| 2.0 | 510 |
| 2.0 | 510 |
| 2.0 | 510 |
| 2.0 | 510 |
| 2.0 | 510 |
| 2.0 | 510 |
| 2.0 | 510 |
| 2.0 | 510 |
| 2.0 | 510 |
| 2.0 | 510 |
| 2.0 | 510 |
| 2.0 | 510 |
| 2.0 | 510 |
| 2.0 | 510 |
| 2.0 | 510 |
| 2.0 | 510 |
| 2.0 | 510 |
| 2.0 | 510 |
| 2.0 | 510 |
| 2.0 | 510 |
| 2.0 | 510 |
| 2.0 | 510 |
| 2.0 | 510 |
| 2.0 | 510 |
| 2.0 | 510 |
| 2.0 | 510 |
| 2.0 | 510 |
| 2.0 | 510 |
| 2.0 | 510 |
| 2.0 | 510 |
| 2.0 | 510 |
| 2.0 | 510 |
| 2.0 | 510 |
| 2.0 | 510 |
| 2.0 | 510 |
| 2.0 | 510 |
| 2.0 | 510 |
| 2.0 | 510 |
| 2.0 | 510 |
| 2.0 | 510 |
| 2.0 | 510 |
| 2.0 | 510 |
| 2.0 | 510 |
| 2.0 | 510 |
| 2.0 | 510 |
| 2.0 | 510 |
| 2.0 | 510 |
| 2.0 | 510 |
| 2.0 | 510 |
| 2.0 | 510 |
| 2.0 | 510 |
| 2.0 | 510 |
| 2.0 | 510 |
| 2.0 | 510 |
| 2.0 | 510 |
| 2.0 | 510 |
| 2.0 | 510 |
| 2.0 | 510 |
| 2.0 | 510 |
| 2.0 | 510 |
| 2.0 | 510 |
| 2.0 | 510 |
| 2.0 | 510 |
| 2.0 | 510 |
| 2.0 | 510 |
| 2.0 | 510 |
| 2.0 | 510 |
| 2.0 | 510 |
| 2.0 | 510 |
| 2.0 | 510 |
| 2.0 | 510 |
| 2.0 | 510 |
| 2.0 | 510 |
| 2.0 | 510 |
| 2.0 | 510 |
| 2.0 | 510 |
| 2.0 | 510 |
| 2.0 | 510 |
| 2.0 | 510 |
| 2.0 | 510 |
| 2.0 | 510 |
| 2.0 | 510 |
| 2.0 | 510 |
| 2.0 | 510 |
| 2.0 | 510 |
| 2.0 | 510 |
| 2.0 | 510 |
| 2.0 | 510 |
| 2.0 | 510 |
| 2.0 | 510 |
| 2.0 | 510 |
| 2.0 | 510 |
| 2.0 | 510 |
| 2.0 | 510 |
| 2.0 | 510 |
| 2.0 | 510 |
| 2.0 | 510 |
| 2.0 | 510 |
| 2.0 | 510 |
| 2.0 | 510 |
| 2.0 | 510 |
| 2.0 | 510 |
| 2.0 | 510 |
| 2.0 | 510 |
| 2.0 | 510 |
| 2.0 | 510 |
| 2.0 | 510 |
| 2.0 | 510 |
| 2.0 | 510 |
| 2.0 | 510 |
| 2.0 | 510 |
| 2.0 | 510 |
| 2.0 | 510 |
| 2.0 | 510 |
| 2.0 | 510 |
| 2.0 | 510 |
| 2.0 | 510 |
| 2.0 | 510 |
| 2.0 | 510 |
| 2.0 | 510 |
| 2.0 | 510 |
| 2.0 | 510 |
| 2.0 | 510 |
| 2.0 | 510 |
| 2.0 | 510 |
| 2.0 | 510 |
| 2.0 | 510 |
| 2.0 | 510 |
| 2.0 | 510 |
| 2.0 | 510 |
| 2.0 | 510 |
| 2.0 | 510 |
| 2.0 | 510 |
| 2.0 | 510 |
| 2.0 | 510 |
| 2.0 | 510 |
| 2.0 | 510 |
| 2.0 | 510 |
| 2.0 | 510 |
| 2.0 | 510 |
| 2.0 | 510 |
| 2.0 | 510 |
| 2.0 | 510 |
| 2.0 | 510 |
| 2.0 | 510 |
| 2.0 | 510 |
| 2.0 | 510 |
| 2.0 | 510 |
| 2.0 | 510 |
| 2.0 | 510 |
| 2.0 | 510 |
| 2.0 | 510 |
| 2.0 | 510 |
| 2.0 | 510 |
| 2.0 | 510 |
| 2.0 | 510 |
| 2.0 | 510 |
| 2.0 | 510 |
| 2.0 | 510 |
| 2.0 | 510 |
| 2.0 | 510 |
| 2.0 | 510 |
| 2.0 | 510 |
| 2.0 | 510 |
| 2.0 | 510 |
| 2.0 | 510 |
| 2.0 | 510 |
| 2.0 | 510 |
| 2.0 | 510 |
| 2.0 | 510 |
| 2.0 | 510 |
| 2.0 | 510 |
| 2.0 | 510 |
| 2.0 | 510 |
| 2.0 | 510 |
| 2.0 | 510 |
| 2.0 | 510 |
| 2.0 | 510 |
| 2.0 | 510 |
| 2.0 | 510 |
| 2.0 | 510 |
| 2.0 | 510 |
| 2.0 | 510 |
| 2.0 | 510 |
| 1.0 | 1456 |
| 1.0 | 1456 |
| 1.0 | 1456 |
| 1.0 | 1456 |
| 1.0 | 1456 |
| 1.0 | 1456 |
| 1.0 | 1456 |
| 1.0 | 1456 |
| 1.0 | 1456 |
| 1.0 | 1456 |
| 1.0 | 1456 |
| 1.0 | 1456 |
| 1.0 | 1456 |
| 1.0 | 1456 |
| 1.0 | 1456 |
| 1.0 | 1456 |
| 1.0 | 1456 |
| 1.0 | 1456 |
| 1.0 | 1456 |
| 1.0 | 1456 |
| 1.0 | 1456 |
| 1.0 | 1456 |
| 1.0 | 1456 |
| 1.0 | 1456 |
| 1.0 | 1456 |
| 1.0 | 1456 |
| 1.0 | 1456 |
| 1.0 | 1456 |
| 1.0 | 1456 |
| 1.0 | 1456 |
| 1.0 | 1456 |
| 1.0 | 1456 |
| 1.0 | 1456 |
| 1.0 | 1456 |
| 1.0 | 1456 |
| 1.0 | 1456 |
| 1.0 | 1456 |
| 1.0 | 1456 |
| 1.0 | 1456 |
| 1.0 | 1456 |
| 1.0 | 1456 |
| 1.0 | 1456 |
| 1.0 | 1456 |
| 1.0 | 1456 |
| 1.0 | 1456 |
| 1.0 | 1456 |
| 1.0 | 1456 |
| 1.0 | 1456 |
| 1.0 | 1456 |
| 1.0 | 1456 |
| 1.0 | 1456 |
| 1.0 | 1456 |
| 1.0 | 1456 |
| 1.0 | 1456 |
| 1.0 | 1456 |
| 1.0 | 1456 |
| 1.0 | 1456 |
| 1.0 | 1456 |
| 1.0 | 1456 |
| 1.0 | 1456 |
| 1.0 | 1456 |
| 1.0 | 1456 |
| 1.0 | 1456 |
| 1.0 | 1456 |
| 1.0 | 1456 |
| 1.0 | 1456 |
| 1.0 | 1456 |
| 1.0 | 1456 |
| 1.0 | 1456 |
| 1.0 | 1456 |
| 1.0 | 1456 |
| 1.0 | 1456 |
| 1.0 | 1456 |
| 1.0 | 1456 |
| 1.0 | 1456 |
| 1.0 | 1456 |
| 1.0 | 1456 |
| 1.0 | 1456 |
| 1.0 | 1456 |
| 1.0 | 1456 |
| 1.0 | 1456 |
| 1.0 | 1456 |
| 1.0 | 1456 |
| 1.0 | 1456 |
| 1.0 | 1456 |
| 1.0 | 1456 |
| 1.0 | 1456 |
| 1.0 | 1456 |
| 1.0 | 1456 |
| 1.0 | 1456 |
| 1.0 | 1456 |
| 1.0 | 1456 |
| 1.0 | 1456 |
| 1.0 | 1456 |
| 1.0 | 1456 |
| 1.0 | 1456 |
| 1.0 | 1456 |
| 1.0 | 1456 |
| 1.0 | 1456 |
| 1.0 | 1456 |
| 1.0 | 1456 |
| 1.0 | 1456 |
| 1.0 | 1456 |
| 1.0 | 1456 |
| 1.0 | 1456 |
| 1.0 | 1456 |
| 1.0 | 1456 |
| 1.0 | 1456 |
| 1.0 | 1456 |
| 1.0 | 1456 |
| 1.0 | 1456 |
| 1.0 | 1456 |
| 1.0 | 1456 |
| 1.0 | 1456 |
| 1.0 | 1456 |
| 1.0 | 1456 |
| 1.0 | 1456 |
| 1.0 | 1456 |
| 1.0 | 1456 |
| 1.0 | 1456 |
| 1.0 | 1456 |
| 1.0 | 1456 |
| 1.0 | 1456 |
| 1.0 | 1456 |
| 1.0 | 1456 |
| 1.0 | 1456 |
| 1.0 | 1456 |
| 1.0 | 1456 |
| 1.0 | 1456 |
| 1.0 | 1456 |
| 1.0 | 1456 |
| 1.0 | 1456 |
| 1.0 | 1456 |
| 1.0 | 1456 |
| 1.0 | 1456 |
| 1.0 | 1456 |
| 1.0 | 1456 |
| 1.0 | 1456 |
| 1.0 | 1456 |
| 1.0 | 1456 |
| 1.0 | 1456 |
| 1.0 | 1456 |
| 1.0 | 1456 |
| 1.0 | 1456 |
| 1.0 | 1456 |
| 1.0 | 1456 |
| 1.0 | 1456 |
| 1.0 | 1456 |
| 1.0 | 1456 |
| 1.0 | 1456 |
| 1.0 | 1456 |
| 1.0 | 1456 |
| 1.0 | 1456 |
| 1.0 | 1456 |
| 1.0 | 1456 |
| 1.0 | 1456 |
| 1.0 | 1456 |
| 1.0 | 1456 |
| 1.0 | 1456 |
| 1.0 | 1456 |
| 1.0 | 1456 |
| 1.0 | 1456 |
| 1.0 | 1456 |
| 1.0 | 1456 |
| 1.0 | 1456 |
| 1.0 | 1456 |
| 1.0 | 1456 |
| 1.0 | 1456 |
| 1.0 | 1456 |
| 1.0 | 1456 |
| 1.0 | 1456 |
| 1.0 | 1456 |
| 1.0 | 1456 |
| 1.0 | 1456 |
| 1.0 | 1456 |
| 1.0 | 1456 |
| 1.0 | 1456 |
| 1.0 | 1456 |
| 1.0 | 1456 |
| 1.0 | 1456 |
| 1.0 | 1456 |
| 1.0 | 1456 |
| 1.0 | 1456 |
| 1.0 | 1456 |
| 1.0 | 1456 |
| 1.0 | 1456 |
| 1.0 | 1456 |
| 1.0 | 1456 |
| 1.0 | 1456 |
| 1.0 | 1456 |
| 1.0 | 1456 |
| 1.0 | 1456 |
| 1.0 | 1456 |
| 1.0 | 1456 |
| 1.0 | 1456 |
| 1.0 | 1456 |
| 1.0 | 1456 |
| 1.0 | 1456 |
| 1.0 | 1456 |
| 1.0 | 1456 |
| 1.0 | 1456 |
| 1.0 | 1456 |
| 1.0 | 1456 |
| 1.0 | 1456 |
| 1.0 | 1456 |
| 1.0 | 1456 |
| 1.0 | 1456 |
| 1.0 | 1456 |
| 1.0 | 1456 |
| 1.0 | 1456 |
| 1.0 | 1456 |
| 1.0 | 1456 |
| 1.0 | 1456 |
| 1.0 | 1456 |
| 1.0 | 1456 |
| 1.0 | 1456 |
| 1.0 | 1456 |
| 1.0 | 1456 |
| 1.0 | 1456 |
| 1.0 | 1456 |
| 1.0 | 1456 |
| 1.0 | 1456 |
| 1.0 | 1456 |
| 1.0 | 1456 |
| 1.0 | 1456 |
| 1.0 | 1456 |
| 1.0 | 1456 |
| 1.0 | 1456 |
| 1.0 | 1456 |
| 1.0 | 1456 |
| 1.0 | 1456 |
| 1.0 | 1456 |
| 1.0 | 1456 |
| 1.0 | 1456 |
| 1.0 | 1456 |
| 1.0 | 1456 |
| 1.0 | 1456 |
| 1.0 | 1456 |
| 1.0 | 1456 |
| 1.0 | 1456 |
| 1.0 | 1456 |
| 1.0 | 1456 |
| 1.0 | 1456 |
| 1.0 | 1456 |
| 1.0 | 1456 |
| 1.0 | 1456 |
| 1.0 | 1456 |
| 1.0 | 1456 |
| 1.0 | 1456 |
| 1.0 | 1456 |
| 1.0 | 1456 |
| 1.0 | 1456 |
| 1.0 | 1456 |
| 1.0 | 1456 |
| 1.0 | 1456 |
| 1.0 | 1456 |
| 1.0 | 1456 |
| 1.0 | 1456 |
| 1.0 | 1456 |
| 1.0 | 1456 |
| 1.0 | 1456 |
| 1.0 | 1456 |
| 1.0 | 1456 |
| 1.0 | 1456 |
| 1.0 | 1456 |
| 1.0 | 1456 |
| 1.0 | 1456 |
| 1.0 | 1456 |
| 1.0 | 1456 |
| 1.0 | 1456 |
| 1.0 | 1456 |
| 1.0 | 1456 |
| 1.0 | 1456 |
| 1.0 | 1456 |
| 1.0 | 1456 |
| 1.0 | 1456 |
| 1.0 | 1456 |
| 1.0 | 1456 |
| 1.0 | 1456 |
| 1.0 | 1456 |
| 1.0 | 1456 |
| 1.0 | 1456 |
| 1.0 | 1456 |
| 1.0 | 1456 |
| 1.0 | 1456 |
| 1.0 | 1456 |
| 1.0 | 1456 |
| 1.0 | 1456 |
| 1.0 | 1456 |
| 1.0 | 1456 |
| 1.0 | 1456 |
| 1.0 | 1456 |
| 1.0 | 1456 |
| 1.0 | 1456 |
| 1.0 | 1456 |
| 1.0 | 1456 |
| 1.0 | 1456 |
| 1.0 | 1456 |
| 1.0 | 1456 |
| 1.0 | 1456 |
| 1.0 | 1456 |
| 1.0 | 1456 |
| 1.0 | 1456 |
| 1.0 | 1456 |
| 1.0 | 1456 |
| 1.0 | 1456 |
| 1.0 | 1456 |
| 1.0 | 1456 |
| 1.0 | 1456 |
| 1.0 | 1456 |
| 1.0 | 1456 |
| 1.0 | 1456 |
| 1.0 | 1456 |
| 1.0 | 1456 |
| 1.0 | 1456 |
| 1.0 | 1456 |
| 1.0 | 1456 |
| 1.0 | 1456 |
| 1.0 | 1456 |
| 1.0 | 1456 |
| 1.0 | 1456 |
| 1.0 | 1456 |
| 1.0 | 1456 |
| 1.0 | 1456 |
| 1.0 | 1456 |
| 1.0 | 1456 |
| 1.0 | 1456 |
| 1.0 | 1456 |
| 1.0 | 1456 |
| 1.0 | 1456 |
| 1.0 | 1456 |
| 1.0 | 1456 |
| 1.0 | 1456 |
| 1.0 | 1456 |
| 1.0 | 1456 |
| 1.0 | 1456 |
| 1.0 | 1456 |
| 1.0 | 1456 |
| 1.0 | 1456 |
| 1.0 | 1456 |
| 1.0 | 1456 |
| 1.0 | 1456 |
| 1.0 | 1456 |
| 1.0 | 1456 |
| 1.0 | 1456 |
| 1.0 | 1456 |
| 1.0 | 1456 |
| 1.0 | 1456 |
| 1.0 | 1456 |
| 1.0 | 1456 |
| 1.0 | 1456 |
| 1.0 | 1456 |
| 1.0 | 1456 |
| 1.0 | 1456 |
| 1.0 | 1456 |
| 1.0 | 1456 |
| 1.0 | 1456 |
| 1.0 | 1456 |
| 1.0 | 1456 |
| 1.0 | 1456 |
| 1.0 | 1456 |
| 1.0 | 1456 |
| 1.0 | 1456 |
| 1.0 | 1456 |
| 1.0 | 1456 |
| 1.0 | 1456 |
| 1.0 | 1456 |
| 1.0 | 1456 |
| 1.0 | 1456 |
| 1.0 | 1456 |
| 1.0 | 1456 |
| 1.0 | 1456 |
| 1.0 | 1456 |
| 1.0 | 1456 |
| 1.0 | 1456 |
| 1.0 | 1456 |
| 1.0 | 1456 |
| 1.0 | 1456 |
| 1.0 | 1456 |
| 1.0 | 1456 |
| 1.0 | 1456 |
| 1.0 | 1456 |
| 1.0 | 1456 |
| 1.0 | 1456 |
| 1.0 | 1456 |
| 1.0 | 1456 |
| 1.0 | 1456 |
| 1.0 | 1456 |
| 1.0 | 1456 |
| 1.0 | 1456 |
| 1.0 | 1456 |
| 1.0 | 1456 |
| 1.0 | 1456 |
| 1.0 | 1456 |
| 1.0 | 1456 |
| 1.0 | 1456 |
| 1.0 | 1456 |
| 1.0 | 1456 |
| 1.0 | 1456 |
| 1.0 | 1456 |
| 1.0 | 1456 |
| 1.0 | 1456 |
| 1.0 | 1456 |
| 1.0 | 1456 |
| 1.0 | 1456 |
| 1.0 | 1456 |
| 1.0 | 1456 |
| 1.0 | 1456 |
| 1.0 | 1456 |
| 1.0 | 1456 |
| 1.0 | 1456 |
| 1.0 | 1456 |
| 1.0 | 1456 |
| 1.0 | 1456 |
| 1.0 | 1456 |
| 1.0 | 1456 |
| 1.0 | 1456 |
| 1.0 | 1456 |
| 1.0 | 1456 |
| 1.0 | 1456 |
| 1.0 | 1456 |
| 1.0 | 1456 |
| 1.0 | 1456 |
| 1.0 | 1456 |
| 1.0 | 1456 |
| 1.0 | 1456 |
| 1.0 | 1456 |
| 1.0 | 1456 |
| 1.0 | 1456 |
| 1.0 | 1456 |
| 1.0 | 1456 |
| 1.0 | 1456 |
| 1.0 | 1456 |
| 1.0 | 1456 |
| 1.0 | 1456 |
| 1.0 | 1456 |
| 1.0 | 1456 |
| 1.0 | 1456 |
| 1.0 | 1456 |
| 1.0 | 1456 |
| 1.0 | 1456 |
| 1.0 | 1456 |
| 1.0 | 1456 |
| 1.0 | 1456 |
| 1.0 | 1456 |
| 1.0 | 1456 |
| 1.0 | 1456 |
| 1.0 | 1456 |
| 1.0 | 1456 |
| 1.0 | 1456 |
| 1.0 | 1456 |
| 1.0 | 1456 |
| 1.0 | 1456 |
| 1.0 | 1456 |
| 1.0 | 1456 |
| 1.0 | 1456 |
| 1.0 | 1456 |
| 1.0 | 1456 |
| 1.0 | 1456 |
| 1.0 | 1456 |
| 1.0 | 1456 |
| 1.0 | 1456 |
| 1.0 | 1456 |
| 1.0 | 1456 |
| 1.0 | 1456 |
| 1.0 | 1456 |
| 1.0 | 1456 |
| 1.0 | 1456 |
| 1.0 | 1456 |
| 1.0 | 1456 |
| 1.0 | 1456 |
| 1.0 | 1456 |
| 1.0 | 1456 |
| 1.0 | 1456 |
| 1.0 | 1456 |
| 1.0 | 1456 |
| 1.0 | 1456 |
| 1.0 | 1456 |
| 1.0 | 1456 |
| 1.0 | 1456 |
| 1.0 | 1456 |
| 1.0 | 1456 |
| 1.0 | 1456 |
| 1.0 | 1456 |
| 1.0 | 1456 |
| 1.0 | 1456 |
| 1.0 | 1456 |
| 1.0 | 1456 |
| 1.0 | 1456 |
| 1.0 | 1456 |
| 1.0 | 1456 |
| 1.0 | 1456 |
| 1.0 | 1456 |
| 1.0 | 1456 |
| 1.0 | 1456 |
| 1.0 | 1456 |
| 1.0 | 1456 |
| 1.0 | 1456 |
| 1.0 | 1456 |
| 1.0 | 1456 |
| 1.0 | 1456 |
| 1.0 | 1456 |
| 1.0 | 1456 |
| 1.0 | 1456 |
| 1.0 | 1456 |
| 1.0 | 1456 |
| 1.0 | 1456 |
| 1.0 | 1456 |
| 1.0 | 1456 |
| 1.0 | 1456 |
| 1.0 | 1456 |
| 1.0 | 1456 |
| 1.0 | 1456 |
| 1.0 | 1456 |
| 1.0 | 1456 |
| 1.0 | 1456 |
| 1.0 | 1456 |
| 1.0 | 1456 |
| 1.0 | 1456 |
| 1.0 | 1456 |
| 1.0 | 1456 |
| 1.0 | 1456 |
| 1.0 | 1456 |
| 1.0 | 1456 |
| 1.0 | 1456 |
| 1.0 | 1456 |
| 1.0 | 1456 |
| 1.0 | 1456 |
| 1.0 | 1456 |
| 1.0 | 1456 |
| 1.0 | 1456 |
| 1.0 | 1456 |
| 1.0 | 1456 |
| 1.0 | 1456 |
| 1.0 | 1456 |
| 1.0 | 1456 |
| 1.0 | 1456 |
| 1.0 | 1456 |
| 1.0 | 1456 |
| 1.0 | 1456 |
| 1.0 | 1456 |
| 1.0 | 1456 |
| 1.0 | 1456 |
| 1.0 | 1456 |
| 1.0 | 1456 |
| 1.0 | 1456 |
| 1.0 | 1456 |
| 1.0 | 1456 |
| 1.0 | 1456 |
| 1.0 | 1456 |
| 1.0 | 1456 |
| 1.0 | 1456 |
| 1.0 | 1456 |
| 1.0 | 1456 |
| 1.0 | 1456 |
| 1.0 | 1456 |
| 1.0 | 1456 |
| 1.0 | 1456 |
| 1.0 | 1456 |
| 1.0 | 1456 |
| 1.0 | 1456 |
| 1.0 | 1456 |
| 1.0 | 1456 |
| 1.0 | 1456 |
| 1.0 | 1456 |
| 1.0 | 1456 |
| 1.0 | 1456 |
| 1.0 | 1456 |
| 1.0 | 1456 |
| 1.0 | 1456 |
| 1.0 | 1456 |
| 1.0 | 1456 |
| 1.0 | 1456 |
| 1.0 | 1456 |
| 1.0 | 1456 |
| 1.0 | 1456 |
| 1.0 | 1456 |
| 1.0 | 1456 |
| 1.0 | 1456 |
| 1.0 | 1456 |
| 1.0 | 1456 |
| 1.0 | 1456 |
| 1.0 | 1456 |
| 1.0 | 1456 |
| 1.0 | 1456 |
| 1.0 | 1456 |
| 1.0 | 1456 |
| 1.0 | 1456 |
| 1.0 | 1456 |
| 1.0 | 1456 |
| 1.0 | 1456 |
| 1.0 | 1456 |
| 1.0 | 1456 |
| 1.0 | 1456 |
| 1.0 | 1456 |
| 1.0 | 1456 |
| 1.0 | 1456 |
| 1.0 | 1456 |
| 1.0 | 1456 |
| 1.0 | 1456 |
| 1.0 | 1456 |
| 1.0 | 1456 |
| 1.0 | 1456 |
| 1.0 | 1456 |
| 1.0 | 1456 |
| 1.0 | 1456 |
| 1.0 | 1456 |
| 1.0 | 1456 |
| 1.0 | 1456 |
| 1.0 | 1456 |
| 1.0 | 1456 |
| 1.0 | 1456 |
| 1.0 | 1456 |
| 1.0 | 1456 |
| 1.0 | 1456 |
| 1.0 | 1456 |
| 1.0 | 1456 |
| 1.0 | 1456 |
| 1.0 | 1456 |
| 1.0 | 1456 |
| 1.0 | 1456 |
| 1.0 | 1456 |
| 1.0 | 1456 |
| 1.0 | 1456 |
| 1.0 | 1456 |
| 1.0 | 1456 |
| 1.0 | 1456 |
| 1.0 | 1456 |
| 1.0 | 1456 |
| 1.0 | 1456 |
| 1.0 | 1456 |
| 1.0 | 1456 |
| 1.0 | 1456 |
| 1.0 | 1456 |
| 1.0 | 1456 |
| 1.0 | 1456 |
| 1.0 | 1456 |
| 1.0 | 1456 |
| 1.0 | 1456 |
| 1.0 | 1456 |
| 1.0 | 1456 |
| 1.0 | 1456 |
| 1.0 | 1456 |
| 1.0 | 1456 |
| 1.0 | 1456 |
| 1.0 | 1456 |
| 1.0 | 1456 |
| 1.0 | 1456 |
| 1.0 | 1456 |
| 1.0 | 1456 |
| 1.0 | 1456 |
| 1.0 | 1456 |
| 1.0 | 1456 |
| 1.0 | 1456 |
| 1.0 | 1456 |
| 1.0 | 1456 |
| 1.0 | 1456 |
| 1.0 | 1456 |
| 1.0 | 1456 |
| 1.0 | 1456 |
| 1.0 | 1456 |
| 1.0 | 1456 |
| 1.0 | 1456 |
| 1.0 | 1456 |
| 1.0 | 1456 |
| 1.0 | 1456 |
| 1.0 | 1456 |
| 1.0 | 1456 |
| 1.0 | 1456 |
| 1.0 | 1456 |
| 1.0 | 1456 |
| 1.0 | 1456 |
| 1.0 | 1456 |
| 1.0 | 1456 |
| 1.0 | 1456 |
| 1.0 | 1456 |
| 1.0 | 1456 |
| 1.0 | 1456 |
| 1.0 | 1456 |
| 1.0 | 1456 |
| 1.0 | 1456 |
| 1.0 | 1456 |
| 1.0 | 1456 |
| 1.0 | 1456 |
| 1.0 | 1456 |
| 1.0 | 1456 |
| 1.0 | 1456 |
| 1.0 | 1456 |
| 1.0 | 1456 |
| 1.0 | 1456 |
| 1.0 | 1456 |
| 1.0 | 1456 |
| 1.0 | 1456 |
| 1.0 | 1456 |
| 1.0 | 1456 |
| 1.0 | 1456 |
| 1.0 | 1456 |
| 1.0 | 1456 |
| 1.0 | 1456 |
| 1.0 | 1456 |
| 1.0 | 1456 |
| 1.0 | 1456 |
| 1.0 | 1456 |
| 1.0 | 1456 |
| 1.0 | 1456 |
| 1.0 | 1456 |
| 1.0 | 1456 |
| 1.0 | 1456 |
| 1.0 | 1456 |
| 1.0 | 1456 |
| 1.0 | 1456 |
| 1.0 | 1456 |
| 1.0 | 1456 |
| 1.0 | 1456 |
| 1.0 | 1456 |
| 1.0 | 1456 |
| 1.0 | 1456 |
| 1.0 | 1456 |
| 1.0 | 1456 |
| 1.0 | 1456 |
| 1.0 | 1456 |
| 1.0 | 1456 |
| 1.0 | 1456 |
| 1.0 | 1456 |
| 1.0 | 1456 |
| 1.0 | 1456 |
| 1.0 | 1456 |
| 1.0 | 1456 |
| 1.0 | 1456 |
| 1.0 | 1456 |
| 1.0 | 1456 |
| 1.0 | 1456 |
| 1.0 | 1456 |
| 1.0 | 1456 |
| 1.0 | 1456 |
| 1.0 | 1456 |
| 1.0 | 1456 |
| 1.0 | 1456 |
| 1.0 | 1456 |
| 1.0 | 1456 |
| 1.0 | 1456 |
| 1.0 | 1456 |
| 1.0 | 1456 |
| 1.0 | 1456 |
| 1.0 | 1456 |
| 1.0 | 1456 |
| 1.0 | 1456 |
| 1.0 | 1456 |
| 1.0 | 1456 |
| 1.0 | 1456 |
| 1.0 | 1456 |
| 1.0 | 1456 |
| 1.0 | 1456 |
| 1.0 | 1456 |
| 1.0 | 1456 |
| 1.0 | 1456 |
| 1.0 | 1456 |
| 1.0 | 1456 |
| 1.0 | 1456 |
| 1.0 | 1456 |
| 1.0 | 1456 |
| 1.0 | 1456 |
| 1.0 | 1456 |
| 1.0 | 1456 |
| 1.0 | 1456 |
| 1.0 | 1456 |
| 1.0 | 1456 |
| 1.0 | 1456 |
| 1.0 | 1456 |
| 1.0 | 1456 |
| 1.0 | 1456 |
| 1.0 | 1456 |
| 1.0 | 1456 |
| 1.0 | 1456 |
| 1.0 | 1456 |
| 1.0 | 1456 |
| 1.0 | 1456 |
| 1.0 | 1456 |
| 1.0 | 1456 |
| 1.0 | 1456 |
| 1.0 | 1456 |
| 1.0 | 1456 |
| 1.0 | 1456 |
| 1.0 | 1456 |
| 1.0 | 1456 |
| 1.0 | 1456 |
| 1.0 | 1456 |
| 1.0 | 1456 |
| 1.0 | 1456 |
| 1.0 | 1456 |
| 1.0 | 1456 |
| 1.0 | 1456 |
| 1.0 | 1456 |
| 1.0 | 1456 |
| 1.0 | 1456 |
| 1.0 | 1456 |
| 1.0 | 1456 |
| 1.0 | 1456 |
| 1.0 | 1456 |
| 1.0 | 1456 |
| 1.0 | 1456 |
| 1.0 | 1456 |
| 1.0 | 1456 |
| 1.0 | 1456 |
| 1.0 | 1456 |
| 1.0 | 1456 |
| 1.0 | 1456 |
| 1.0 | 1456 |
| 1.0 | 1456 |
| 1.0 | 1456 |
| 1.0 | 1456 |
| 1.0 | 1456 |
| 1.0 | 1456 |
| 1.0 | 1456 |
| 1.0 | 1456 |
| 1.0 | 1456 |
| 1.0 | 1456 |
| 1.0 | 1456 |
| 1.0 | 1456 |
| 1.0 | 1456 |
| 1.0 | 1456 |
| 1.0 | 1456 |
| 1.0 | 1456 |
| 1.0 | 1456 |
| 1.0 | 1456 |
| 1.0 | 1456 |
| 1.0 | 1456 |
| 1.0 | 1456 |
| 1.0 | 1456 |
| 1.0 | 1456 |
| 1.0 | 1456 |
| 1.0 | 1456 |
| 1.0 | 1456 |
| 1.0 | 1456 |
| 1.0 | 1456 |
| 1.0 | 1456 |
| 1.0 | 1456 |
| 1.0 | 1456 |
| 1.0 | 1456 |
| 1.0 | 1456 |
| 1.0 | 1456 |
| 1.0 | 1456 |
| 1.0 | 1456 |
| 1.0 | 1456 |
| 1.0 | 1456 |
| 1.0 | 1456 |
| 1.0 | 1456 |
| 1.0 | 1456 |
| 1.0 | 1456 |
| 1.0 | 1456 |
| 1.0 | 1456 |
| 1.0 | 1456 |
| 1.0 | 1456 |
| 1.0 | 1456 |
| 1.0 | 1456 |
| 1.0 | 1456 |
| 1.0 | 1456 |
| 1.0 | 1456 |
| 1.0 | 1456 |
| 1.0 | 1456 |
| 1.0 | 1456 |
| 1.0 | 1456 |
| 1.0 | 1456 |
| 1.0 | 1456 |
| 1.0 | 1456 |
| 1.0 | 1456 |
| 1.0 | 1456 |
| 1.0 | 1456 |
| 1.0 | 1456 |
| 1.0 | 1456 |
| 1.0 | 1456 |
| 1.0 | 1456 |
| 1.0 | 1456 |
| 1.0 | 1456 |
| 1.0 | 1456 |
| 1.0 | 1456 |
| 1.0 | 1456 |
| 1.0 | 1456 |
| 1.0 | 1456 |
| 1.0 | 1456 |
| 1.0 | 1456 |
| 1.0 | 1456 |
| 1.0 | 1456 |
| 1.0 | 1456 |
| 1.0 | 1456 |
| 1.0 | 1456 |
| 1.0 | 1456 |
| 1.0 | 1456 |
| 1.0 | 1456 |
| 1.0 | 1456 |
| 1.0 | 1456 |
| 1.0 | 1456 |
| 1.0 | 1456 |
| 1.0 | 1456 |
| 1.0 | 1456 |
| 1.0 | 1456 |
| 1.0 | 1456 |
| 1.0 | 1456 |
| 1.0 | 1456 |
| 1.0 | 1456 |
| 1.0 | 1456 |
| 1.0 | 1456 |
| 1.0 | 1456 |
| 1.0 | 1456 |
| 1.0 | 1456 |
| 1.0 | 1456 |
| 1.0 | 1456 |
| 1.0 | 1456 |
| 1.0 | 1456 |
| 1.0 | 1456 |
| 1.0 | 1456 |
| 1.0 | 1456 |
| 1.0 | 1456 |
| 1.0 | 1456 |
| 1.0 | 1456 |
| 1.0 | 1456 |
| 1.0 | 1456 |
| 1.0 | 1456 |
| 1.0 | 1456 |
| 1.0 | 1456 |
| 1.0 | 1456 |
| 1.0 | 1456 |
| 1.0 | 1456 |
| 1.0 | 1456 |
| 1.0 | 1456 |
| 1.0 | 1456 |
| 1.0 | 1456 |
| 1.0 | 1456 |
| 1.0 | 1456 |
| 1.0 | 1456 |
| 1.0 | 1456 |
| 1.0 | 1456 |
| 1.0 | 1456 |
| 1.0 | 1456 |
| 1.0 | 1456 |
| 1.0 | 1456 |
| 1.0 | 1456 |
| 1.0 | 1456 |
| 1.0 | 1456 |
| 1.0 | 1456 |
| 1.0 | 1456 |
| 1.0 | 1456 |
| 1.0 | 1456 |
| 1.0 | 1456 |
| 1.0 | 1456 |
| 1.0 | 1456 |
| 1.0 | 1456 |
| 1.0 | 1456 |
| 1.0 | 1456 |
| 1.0 | 1456 |
| 1.0 | 1456 |
| 1.0 | 1456 |
| 1.0 | 1456 |
| 1.0 | 1456 |
| 1.0 | 1456 |
| 1.0 | 1456 |
| 1.0 | 1456 |
| 1.0 | 1456 |
| 1.0 | 1456 |
| 1.0 | 1456 |
| 1.0 | 1456 |
| 1.0 | 1456 |
| 1.0 | 1456 |
| 1.0 | 1456 |
| 1.0 | 1456 |
| 1.0 | 1456 |
| 1.0 | 1456 |
| 1.0 | 1456 |
| 1.0 | 1456 |
| 1.0 | 1456 |
| 1.0 | 1456 |
| 1.0 | 1456 |
| 1.0 | 1456 |
| 1.0 | 1456 |
| 1.0 | 1456 |
| 1.0 | 1456 |
| 1.0 | 1456 |
| 1.0 | 1456 |
| 1.0 | 1456 |
| 1.0 | 1456 |
| 1.0 | 1456 |
| 1.0 | 1456 |
| 1.0 | 1456 |
| 1.0 | 1456 |
| 1.0 | 1456 |
| 1.0 | 1456 |
| 1.0 | 1456 |
| 1.0 | 1456 |
| 1.0 | 1456 |
| 1.0 | 1456 |
| 1.0 | 1456 |
| 1.0 | 1456 |
| 1.0 | 1456 |
| 1.0 | 1456 |
| 1.0 | 1456 |
| 1.0 | 1456 |
| 1.0 | 1456 |
| 1.0 | 1456 |
| 1.0 | 1456 |
| 1.0 | 1456 |
| 1.0 | 1456 |
| 1.0 | 1456 |
| 1.0 | 1456 |
| 1.0 | 1456 |
| 1.0 | 1456 |
| 1.0 | 1456 |
| 1.0 | 1456 |
| 1.0 | 1456 |
| 1.0 | 1456 |
| 1.0 | 1456 |
| 1.0 | 1456 |
| 1.0 | 1456 |
| 1.0 | 1456 |
| 1.0 | 1456 |
| 1.0 | 1456 |
| 1.0 | 1456 |
| 1.0 | 1456 |
| 1.0 | 1456 |
| 1.0 | 1456 |
| 1.0 | 1456 |
| 1.0 | 1456 |
| 1.0 | 1456 |
| 1.0 | 1456 |
| 1.0 | 1456 |
| 1.0 | 1456 |
| 1.0 | 1456 |
| 1.0 | 1456 |
| 1.0 | 1456 |
| 1.0 | 1456 |
| 1.0 | 1456 |
| 1.0 | 1456 |
| 1.0 | 1456 |
| 1.0 | 1456 |
| 1.0 | 1456 |
| 1.0 | 1456 |
| 1.0 | 1456 |
| 1.0 | 1456 |
| 1.0 | 1456 |
| 1.0 | 1456 |
| 1.0 | 1456 |
| 1.0 | 1456 |
| 1.0 | 1456 |
| 1.0 | 1456 |
| 1.0 | 1456 |
| 1.0 | 1456 |
| 1.0 | 1456 |
| 1.0 | 1456 |
| 1.0 | 1456 |
| 1.0 | 1456 |
| 1.0 | 1456 |
| 1.0 | 1456 |
| 1.0 | 1456 |
| 1.0 | 1456 |
| 1.0 | 1456 |
| 1.0 | 1456 |
| 1.0 | 1456 |
| 1.0 | 1456 |
| 1.0 | 1456 |
| 1.0 | 1456 |
| 1.0 | 1456 |
| 1.0 | 1456 |
| 1.0 | 1456 |
| 1.0 | 1456 |
| 1.0 | 1456 |
| 1.0 | 1456 |
| 1.0 | 1456 |
| 1.0 | 1456 |
| 1.0 | 1456 |
| 1.0 | 1456 |
| 1.0 | 1456 |
| 1.0 | 1456 |
| 1.0 | 1456 |
| 1.0 | 1456 |
| 1.0 | 1456 |
| 1.0 | 1456 |
| 1.0 | 1456 |
| 1.0 | 1456 |
| 1.0 | 1456 |
| 1.0 | 1456 |
| 1.0 | 1456 |
| 1.0 | 1456 |
| 1.0 | 1456 |
| 1.0 | 1456 |
| 1.0 | 1456 |
| 1.0 | 1456 |
| 1.0 | 1456 |
| 1.0 | 1456 |
| 1.0 | 1456 |
| 1.0 | 1456 |
| 1.0 | 1456 |
| 1.0 | 1456 |
| 1.0 | 1456 |
| 1.0 | 1456 |
| 1.0 | 1456 |
| 1.0 | 1456 |
| 1.0 | 1456 |
| 1.0 | 1456 |
| 1.0 | 1456 |
| 1.0 | 1456 |
| 1.0 | 1456 |
| 1.0 | 1456 |
| 1.0 | 1456 |
| 1.0 | 1456 |
| 1.0 | 1456 |
| 1.0 | 1456 |
| 1.0 | 1456 |
| 1.0 | 1456 |
| 1.0 | 1456 |
| 1.0 | 1456 |
| 1.0 | 1456 |
| 1.0 | 1456 |
| 1.0 | 1456 |
| 1.0 | 1456 |
| 1.0 | 1456 |
| 1.0 | 1456 |
| 1.0 | 1456 |
| 1.0 | 1456 |
| 1.0 | 1456 |
| 1.0 | 1456 |
| 1.0 | 1456 |
| 1.0 | 1456 |
| 1.0 | 1456 |
| 1.0 | 1456 |
| 1.0 | 1456 |
| 1.0 | 1456 |
| 1.0 | 1456 |
| 1.0 | 1456 |
| 1.0 | 1456 |
| 1.0 | 1456 |
| 1.0 | 1456 |
| 1.0 | 1456 |
| 1.0 | 1456 |
| 1.0 | 1456 |
| 1.0 | 1456 |
| 1.0 | 1456 |
| 1.0 | 1456 |
| 1.0 | 1456 |
| 1.0 | 1456 |
| 1.0 | 1456 |
| 1.0 | 1456 |
| 1.0 | 1456 |
| 1.0 | 1456 |
| 1.0 | 1456 |
| 1.0 | 1456 |
| 1.0 | 1456 |
| 1.0 | 1456 |
| 1.0 | 1456 |
| 1.0 | 1456 |
| 1.0 | 1456 |
| 1.0 | 1456 |
| 1.0 | 1456 |
| 1.0 | 1456 |
| 1.0 | 1456 |
| 1.0 | 1456 |
| 1.0 | 1456 |
| 1.0 | 1456 |
| 1.0 | 1456 |
| 1.0 | 1456 |
| 1.0 | 1456 |
| 1.0 | 1456 |
| 1.0 | 1456 |
| 1.0 | 1456 |
| 1.0 | 1456 |
| 1.0 | 1456 |
| 1.0 | 1456 |
| 1.0 | 1456 |
| 1.0 | 1456 |
| 1.0 | 1456 |
| 1.0 | 1456 |
| 1.0 | 1456 |
| 1.0 | 1456 |
| 1.0 | 1456 |
| 1.0 | 1456 |
| 1.0 | 1456 |
| 1.0 | 1456 |
| 1.0 | 1456 |
| 1.0 | 1456 |
| 1.0 | 1456 |
| 1.0 | 1456 |
| 1.0 | 1456 |
| 1.0 | 1456 |
| 1.0 | 1456 |
| 1.0 | 1456 |
| 1.0 | 1456 |
| 1.0 | 1456 |
| 1.0 | 1456 |
| 1.0 | 1456 |
| 1.0 | 1456 |
| 1.0 | 1456 |
| 1.0 | 1456 |
| 1.0 | 1456 |
| 1.0 | 1456 |
| 1.0 | 1456 |
| 1.0 | 1456 |
| 1.0 | 1456 |
| 1.0 | 1456 |
| 1.0 | 1456 |
| 1.0 | 1456 |
| 1.0 | 1456 |
| 1.0 | 1456 |
| 1.0 | 1456 |
| 1.0 | 1456 |
| 1.0 | 1456 |
| 1.0 | 1456 |
| 1.0 | 1456 |
| 1.0 | 1456 |
| 1.0 | 1456 |
| 1.0 | 1456 |
| 1.0 | 1456 |
| 1.0 | 1456 |
| 1.0 | 1456 |
| 1.0 | 1456 |
| 1.0 | 1456 |
| 1.0 | 1456 |
| 1.0 | 1456 |
| 1.0 | 1456 |
| 1.0 | 1456 |
| 1.0 | 1456 |
| 1.0 | 1456 |
| 1.0 | 1456 |
| 1.0 | 1456 |
| 1.0 | 1456 |
| 1.0 | 1456 |
| 1.0 | 1456 |
| 1.0 | 1456 |
| 1.0 | 1456 |
| 1.0 | 1456 |
| 1.0 | 1456 |
| 1.0 | 1456 |
| 1.0 | 1456 |
| 1.0 | 1456 |
| 1.0 | 1456 |
| 1.0 | 1456 |
| 1.0 | 1456 |
| 1.0 | 1456 |
| 1.0 | 1456 |
| 1.0 | 1456 |
| 1.0 | 1456 |
| 1.0 | 1456 |
| 1.0 | 1456 |
| 1.0 | 1456 |
| 1.0 | 1456 |
| 1.0 | 1456 |
| 1.0 | 1456 |
| 1.0 | 1456 |
| 1.0 | 1456 |
| 1.0 | 1456 |
| 1.0 | 1456 |
| 1.0 | 1456 |
| 1.0 | 1456 |
| 1.0 | 1456 |
| 1.0 | 1456 |
| 1.0 | 1456 |
| 1.0 | 1456 |
| 1.0 | 1456 |
| 1.0 | 1456 |
| 1.0 | 1456 |
| 1.0 | 1456 |
| 1.0 | 1456 |
| 1.0 | 1456 |
| 1.0 | 1456 |
| 1.0 | 1456 |
| 1.0 | 1456 |
| 1.0 | 1456 |
| 1.0 | 1456 |
| 1.0 | 1456 |
| 1.0 | 1456 |
| 1.0 | 1456 |
| 1.0 | 1456 |
| 1.0 | 1456 |
| 1.0 | 1456 |
| 1.0 | 1456 |
| 1.0 | 1456 |
| 1.0 | 1456 |
| 1.0 | 1456 |
| 1.0 | 1456 |
| 1.0 | 1456 |
| 1.0 | 1456 |
| 1.0 | 1456 |
| 1.0 | 1456 |
| 1.0 | 1456 |
| 1.0 | 1456 |
| 1.0 | 1456 |
| 1.0 | 1456 |
| 1.0 | 1456 |
| 1.0 | 1456 |
| 1.0 | 1456 |
| 1.0 | 1456 |
| 1.0 | 1456 |
| 1.0 | 1456 |
| 1.0 | 1456 |
| 1.0 | 1456 |
| 1.0 | 1456 |
| 1.0 | 1456 |
| 1.0 | 1456 |
| 1.0 | 1456 |
| 1.0 | 1456 |
| 1.0 | 1456 |
| 1.0 | 1456 |
| 1.0 | 1456 |
| 1.0 | 1456 |
| 1.0 | 1456 |
| 1.0 | 1456 |
| 1.0 | 1456 |
| 1.0 | 1456 |
| 1.0 | 1456 |
| 1.0 | 1456 |
| 1.0 | 1456 |
| 1.0 | 1456 |
| 1.0 | 1456 |
| 1.0 | 1456 |
| 1.0 | 1456 |
| 1.0 | 1456 |
| 1.0 | 1456 |
| 1.0 | 1456 |
| 1.0 | 1456 |
| 1.0 | 1456 |
| 1.0 | 1456 |
| 1.0 | 1456 |
| 1.0 | 1456 |
| 1.0 | 1456 |
| 1.0 | 1456 |
| 1.0 | 1456 |
| 1.0 | 1456 |
| 1.0 | 1456 |
| 1.0 | 1456 |
| 1.0 | 1456 |
| 1.0 | 1456 |
| 1.0 | 1456 |
| 1.0 | 1456 |
| 1.0 | 1456 |
| 1.0 | 1456 |
| 1.0 | 1456 |
| 1.0 | 1456 |
| 1.0 | 1456 |
| 1.0 | 1456 |
| 1.0 | 1456 |
| 1.0 | 1456 |
| 1.0 | 1456 |
| 1.0 | 1456 |
| 1.0 | 1456 |
| 1.0 | 1456 |
| 1.0 | 1456 |
| 1.0 | 1456 |
| 1.0 | 1456 |
| 1.0 | 1456 |
| 1.0 | 1456 |
| 1.0 | 1456 |
| 1.0 | 1456 |
| 1.0 | 1456 |
| 1.0 | 1456 |
| 1.0 | 1456 |
| 1.0 | 1456 |
| 1.0 | 1456 |
| 1.0 | 1456 |
| 1.0 | 1456 |
| 1.0 | 1456 |
| 1.0 | 1456 |
| 1.0 | 1456 |
| 1.0 | 1456 |
| 1.0 | 1456 |
| 1.0 | 1456 |
| 1.0 | 1456 |
| 1.0 | 1456 |
| 1.0 | 1456 |
| 1.0 | 1456 |
| 1.0 | 1456 |
| 1.0 | 1456 |
| 1.0 | 1456 |
| 1.0 | 1456 |
| 1.0 | 1456 |
| 1.0 | 1456 |
| 1.0 | 1456 |
| 1.0 | 1456 |
| 1.0 | 1456 |
| 1.0 | 1456 |
| 1.0 | 1456 |
| 1.0 | 1456 |
| 1.0 | 1456 |
| 1.0 | 1456 |
| 1.0 | 1456 |
| 1.0 | 1456 |
| 1.0 | 1456 |
| 1.0 | 1456 |
| 1.0 | 1456 |
| 1.0 | 1456 |
| 1.0 | 1456 |
| 1.0 | 1456 |
| 1.0 | 1456 |
| 1.0 | 1456 |
| 1.0 | 1456 |
| 1.0 | 1456 |
| 1.0 | 1456 |
| 1.0 | 1456 |
| 1.0 | 1456 |
| 1.0 | 1456 |
| 1.0 | 1456 |
| 1.0 | 1456 |
| 1.0 | 1456 |
| 1.0 | 1456 |
| 1.0 | 1456 |
| 1.0 | 1456 |
| 1.0 | 1456 |
| 1.0 | 1456 |
| 1.0 | 1456 |
| 1.0 | 1456 |
| 1.0 | 1456 |
| 1.0 | 1456 |
| 1.0 | 1456 |
| 1.0 | 1456 |
| 1.0 | 1456 |
| 1.0 | 1456 |
| 1.0 | 1456 |
| 1.0 | 1456 |
| 1.0 | 1456 |
| 1.0 | 1456 |
| 1.0 | 1456 |
| 1.0 | 1456 |
| 1.0 | 1456 |
| 1.0 | 1456 |
| 1.0 | 1456 |
| 1.0 | 1456 |
| 1.0 | 1456 |
| 1.0 | 1456 |
| 1.0 | 1456 |
| 1.0 | 1456 |
| 1.0 | 1456 |
| 1.0 | 1456 |
| 1.0 | 1456 |
| 1.0 | 1456 |
| 1.0 | 1456 |
| 1.0 | 1456 |
| 1.0 | 1456 |
| 1.0 | 1456 |
| 1.0 | 1456 |
| 1.0 | 1456 |
| 1.0 | 1456 |
| 1.0 | 1456 |
| 1.0 | 1456 |
| 1.0 | 1456 |
| 1.0 | 1456 |
| 1.0 | 1456 |
| 1.0 | 1456 |
| 1.0 | 1456 |
| 1.0 | 1456 |
| 1.0 | 1456 |
| 1.0 | 1456 |
| 1.0 | 1456 |
| 1.0 | 1456 |
| 1.0 | 1456 |
| 1.0 | 1456 |
| 1.0 | 1456 |
| 1.0 | 1456 |
| 1.0 | 1456 |
| 1.0 | 1456 |
| 1.0 | 1456 |